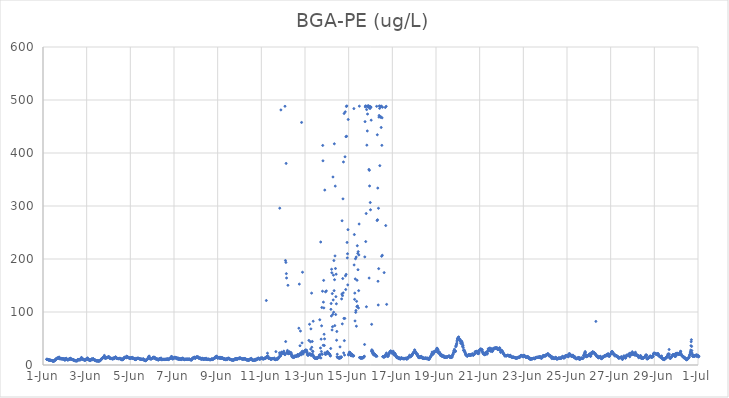
| Category | BGA-PE (ug/L) |
|---|---|
| 45078.166666666664 | 10.81 |
| 45078.177083333336 | 10.77 |
| 45078.1875 | 10.35 |
| 45078.197916666664 | 10.37 |
| 45078.208333333336 | 10.63 |
| 45078.21875 | 10.63 |
| 45078.229166666664 | 10.26 |
| 45078.239583333336 | 9.7 |
| 45078.25 | 9.62 |
| 45078.260416666664 | 9.4 |
| 45078.270833333336 | 9.34 |
| 45078.28125 | 9.77 |
| 45078.291666666664 | 9.37 |
| 45078.302083333336 | 9.26 |
| 45078.3125 | 9.15 |
| 45078.322916666664 | 9.18 |
| 45078.333333333336 | 8.92 |
| 45078.34375 | 8.85 |
| 45078.354166666664 | 8.88 |
| 45078.364583333336 | 8.66 |
| 45078.375 | 8.31 |
| 45078.385416666664 | 8.56 |
| 45078.395833333336 | 8.57 |
| 45078.40625 | 8.27 |
| 45078.416666666664 | 8.14 |
| 45078.427083333336 | 7.9 |
| 45078.4375 | 7.72 |
| 45078.447916666664 | 7.33 |
| 45078.458333333336 | 7.39 |
| 45078.46875 | 7.33 |
| 45078.479166666664 | 7.15 |
| 45078.489583333336 | 7.4 |
| 45078.5 | 7 |
| 45078.510416666664 | 7.7 |
| 45078.520833333336 | 8.78 |
| 45078.53125 | 8.8 |
| 45078.541666666664 | 8.57 |
| 45078.552083333336 | 9.94 |
| 45078.5625 | 9.75 |
| 45078.572916666664 | 9.3 |
| 45078.583333333336 | 10.43 |
| 45078.59375 | 11.25 |
| 45078.604166666664 | 10.8 |
| 45078.614583333336 | 12.3 |
| 45078.625 | 12.34 |
| 45078.635416666664 | 12.37 |
| 45078.645833333336 | 12.98 |
| 45078.65625 | 12.93 |
| 45078.666666666664 | 13.21 |
| 45078.677083333336 | 12.7 |
| 45078.6875 | 13.01 |
| 45078.697916666664 | 13.29 |
| 45078.708333333336 | 12.99 |
| 45078.71875 | 12.64 |
| 45078.729166666664 | 14.47 |
| 45078.739583333336 | 15.01 |
| 45078.75 | 13.16 |
| 45078.760416666664 | 12.14 |
| 45078.770833333336 | 11.75 |
| 45078.78125 | 11.6 |
| 45078.791666666664 | 11.71 |
| 45078.802083333336 | 12.4 |
| 45078.8125 | 12.02 |
| 45078.822916666664 | 12.32 |
| 45078.833333333336 | 12.54 |
| 45078.84375 | 11.91 |
| 45078.854166666664 | 11.48 |
| 45078.864583333336 | 11.45 |
| 45078.875 | 11.58 |
| 45078.885416666664 | 11.54 |
| 45078.895833333336 | 12.14 |
| 45078.90625 | 11.28 |
| 45078.916666666664 | 11.31 |
| 45078.927083333336 | 11.13 |
| 45078.9375 | 11.44 |
| 45078.947916666664 | 11.35 |
| 45078.958333333336 | 11.43 |
| 45078.96875 | 11.65 |
| 45078.979166666664 | 10.99 |
| 45078.989583333336 | 10.3 |
| 45079.0 | 9.05 |
| 45079.010416666664 | 9.32 |
| 45079.020833333336 | 11.8 |
| 45079.03125 | 11.96 |
| 45079.041666666664 | 11.67 |
| 45079.052083333336 | 11.95 |
| 45079.0625 | 12.75 |
| 45079.072916666664 | 11.94 |
| 45079.083333333336 | 11.46 |
| 45079.09375 | 10.55 |
| 45079.104166666664 | 10.71 |
| 45079.114583333336 | 10.12 |
| 45079.125 | 10.19 |
| 45079.135416666664 | 9.4 |
| 45079.145833333336 | 9.25 |
| 45079.15625 | 10.88 |
| 45079.166666666664 | 10.48 |
| 45079.177083333336 | 10.31 |
| 45079.1875 | 10.72 |
| 45079.197916666664 | 11.19 |
| 45079.208333333336 | 11.57 |
| 45079.21875 | 10.95 |
| 45079.229166666664 | 11.09 |
| 45079.239583333336 | 12.24 |
| 45079.25 | 12.82 |
| 45079.260416666664 | 11.53 |
| 45079.270833333336 | 10.8 |
| 45079.28125 | 11.95 |
| 45079.291666666664 | 10.8 |
| 45079.302083333336 | 10.86 |
| 45079.3125 | 10.47 |
| 45079.322916666664 | 10.61 |
| 45079.333333333336 | 10.8 |
| 45079.34375 | 10.16 |
| 45079.354166666664 | 10.04 |
| 45079.364583333336 | 10.22 |
| 45079.375 | 9.88 |
| 45079.385416666664 | 9.71 |
| 45079.395833333336 | 9.94 |
| 45079.40625 | 8.87 |
| 45079.416666666664 | 9.03 |
| 45079.427083333336 | 8.78 |
| 45079.4375 | 9.24 |
| 45079.447916666664 | 8.2 |
| 45079.458333333336 | 8.33 |
| 45079.46875 | 8.56 |
| 45079.479166666664 | 8.3 |
| 45079.489583333336 | 8.27 |
| 45079.5 | 7.51 |
| 45079.510416666664 | 8.25 |
| 45079.520833333336 | 8.45 |
| 45079.53125 | 8 |
| 45079.541666666664 | 7.95 |
| 45079.552083333336 | 7.73 |
| 45079.5625 | 7.63 |
| 45079.572916666664 | 8.63 |
| 45079.583333333336 | 9.19 |
| 45079.59375 | 10.37 |
| 45079.604166666664 | 9.85 |
| 45079.614583333336 | 9.75 |
| 45079.625 | 10.04 |
| 45079.635416666664 | 10 |
| 45079.645833333336 | 10.19 |
| 45079.65625 | 10.69 |
| 45079.666666666664 | 9.67 |
| 45079.677083333336 | 9.76 |
| 45079.6875 | 9.89 |
| 45079.697916666664 | 10.88 |
| 45079.708333333336 | 10.46 |
| 45079.71875 | 9.64 |
| 45079.729166666664 | 10.86 |
| 45079.739583333336 | 12.36 |
| 45079.75 | 12.41 |
| 45079.760416666664 | 14.23 |
| 45079.770833333336 | 13.57 |
| 45079.78125 | 11.77 |
| 45079.791666666664 | 11 |
| 45079.802083333336 | 11.28 |
| 45079.8125 | 11.03 |
| 45079.822916666664 | 10.96 |
| 45079.833333333336 | 11.15 |
| 45079.84375 | 10.66 |
| 45079.854166666664 | 10.65 |
| 45079.864583333336 | 10.25 |
| 45079.875 | 9.65 |
| 45079.885416666664 | 9.44 |
| 45079.895833333336 | 9.11 |
| 45079.90625 | 9.39 |
| 45079.916666666664 | 9.28 |
| 45079.927083333336 | 8.91 |
| 45079.9375 | 9.39 |
| 45079.947916666664 | 9.58 |
| 45079.958333333336 | 10.76 |
| 45079.96875 | 10.35 |
| 45079.979166666664 | 10.95 |
| 45079.989583333336 | 11.76 |
| 45080.0 | 11.17 |
| 45080.010416666664 | 11.07 |
| 45080.020833333336 | 11.18 |
| 45080.03125 | 12.58 |
| 45080.041666666664 | 13.38 |
| 45080.052083333336 | 11.37 |
| 45080.0625 | 11.43 |
| 45080.072916666664 | 9.9 |
| 45080.083333333336 | 9.93 |
| 45080.09375 | 9.94 |
| 45080.104166666664 | 10.17 |
| 45080.114583333336 | 10.21 |
| 45080.125 | 10.12 |
| 45080.135416666664 | 9.01 |
| 45080.145833333336 | 8.44 |
| 45080.15625 | 8.1 |
| 45080.166666666664 | 9.45 |
| 45080.177083333336 | 9.64 |
| 45080.1875 | 8.89 |
| 45080.197916666664 | 9.47 |
| 45080.208333333336 | 10.56 |
| 45080.21875 | 10.87 |
| 45080.229166666664 | 11.27 |
| 45080.239583333336 | 11.2 |
| 45080.25 | 10.38 |
| 45080.260416666664 | 10.29 |
| 45080.270833333336 | 10.09 |
| 45080.28125 | 10.67 |
| 45080.291666666664 | 12.09 |
| 45080.302083333336 | 11.79 |
| 45080.3125 | 10.56 |
| 45080.322916666664 | 10.71 |
| 45080.333333333336 | 10.58 |
| 45080.34375 | 9.72 |
| 45080.354166666664 | 9.1 |
| 45080.364583333336 | 8.88 |
| 45080.375 | 9.7 |
| 45080.385416666664 | 9.38 |
| 45080.395833333336 | 8.87 |
| 45080.40625 | 8.84 |
| 45080.416666666664 | 8.16 |
| 45080.427083333336 | 7.86 |
| 45080.4375 | 7.9 |
| 45080.447916666664 | 7.79 |
| 45080.458333333336 | 8.06 |
| 45080.46875 | 7.65 |
| 45080.479166666664 | 7.91 |
| 45080.489583333336 | 7.88 |
| 45080.5 | 7.65 |
| 45080.510416666664 | 7.66 |
| 45080.520833333336 | 7.95 |
| 45080.53125 | 7.54 |
| 45080.541666666664 | 7.15 |
| 45080.552083333336 | 7.63 |
| 45080.5625 | 7.9 |
| 45080.572916666664 | 7.79 |
| 45080.583333333336 | 7.64 |
| 45080.59375 | 7.97 |
| 45080.604166666664 | 8.16 |
| 45080.614583333336 | 7.93 |
| 45080.625 | 8.56 |
| 45080.635416666664 | 8.84 |
| 45080.645833333336 | 9.86 |
| 45080.65625 | 10.56 |
| 45080.666666666664 | 11.32 |
| 45080.677083333336 | 11.18 |
| 45080.6875 | 11.37 |
| 45080.697916666664 | 12.11 |
| 45080.708333333336 | 11.75 |
| 45080.71875 | 12.79 |
| 45080.729166666664 | 13.21 |
| 45080.739583333336 | 13.88 |
| 45080.75 | 14.28 |
| 45080.760416666664 | 14.29 |
| 45080.770833333336 | 14.77 |
| 45080.78125 | 15.59 |
| 45080.791666666664 | 14.17 |
| 45080.802083333336 | 16.22 |
| 45080.8125 | 18.12 |
| 45080.822916666664 | 14.23 |
| 45080.833333333336 | 12.89 |
| 45080.84375 | 13.37 |
| 45080.854166666664 | 13.21 |
| 45080.864583333336 | 12.62 |
| 45080.875 | 12.79 |
| 45080.885416666664 | 13.35 |
| 45080.895833333336 | 13.41 |
| 45080.90625 | 13.89 |
| 45080.916666666664 | 14.18 |
| 45080.927083333336 | 14.44 |
| 45080.9375 | 14.64 |
| 45080.947916666664 | 14.06 |
| 45080.958333333336 | 13.97 |
| 45080.96875 | 14.42 |
| 45080.979166666664 | 15.06 |
| 45080.989583333336 | 15.35 |
| 45081.0 | 14.92 |
| 45081.010416666664 | 15.9 |
| 45081.020833333336 | 15.15 |
| 45081.03125 | 14.37 |
| 45081.041666666664 | 14.33 |
| 45081.052083333336 | 12.56 |
| 45081.0625 | 13.2 |
| 45081.072916666664 | 12.9 |
| 45081.083333333336 | 12.86 |
| 45081.09375 | 12.15 |
| 45081.104166666664 | 12.17 |
| 45081.114583333336 | 12.42 |
| 45081.125 | 12.36 |
| 45081.135416666664 | 12.4 |
| 45081.145833333336 | 12.08 |
| 45081.15625 | 12.14 |
| 45081.166666666664 | 11.63 |
| 45081.177083333336 | 11.65 |
| 45081.1875 | 11.36 |
| 45081.197916666664 | 12.67 |
| 45081.208333333336 | 12.86 |
| 45081.21875 | 13.11 |
| 45081.229166666664 | 12.36 |
| 45081.239583333336 | 11.59 |
| 45081.25 | 13.48 |
| 45081.260416666664 | 12.46 |
| 45081.270833333336 | 12.23 |
| 45081.28125 | 12.64 |
| 45081.291666666664 | 14.08 |
| 45081.302083333336 | 14.53 |
| 45081.3125 | 14.69 |
| 45081.322916666664 | 15.16 |
| 45081.333333333336 | 14.82 |
| 45081.34375 | 13.65 |
| 45081.354166666664 | 14.23 |
| 45081.364583333336 | 13.51 |
| 45081.375 | 12.37 |
| 45081.385416666664 | 12.41 |
| 45081.395833333336 | 12.38 |
| 45081.40625 | 12.33 |
| 45081.416666666664 | 12.19 |
| 45081.427083333336 | 12.08 |
| 45081.4375 | 12.07 |
| 45081.447916666664 | 11.8 |
| 45081.458333333336 | 12.04 |
| 45081.46875 | 12.13 |
| 45081.479166666664 | 12.33 |
| 45081.489583333336 | 12.72 |
| 45081.5 | 12.39 |
| 45081.510416666664 | 12.05 |
| 45081.520833333336 | 11.77 |
| 45081.53125 | 12.26 |
| 45081.541666666664 | 12.22 |
| 45081.552083333336 | 12.44 |
| 45081.5625 | 11.04 |
| 45081.572916666664 | 11.05 |
| 45081.583333333336 | 10.63 |
| 45081.59375 | 11.15 |
| 45081.604166666664 | 10.63 |
| 45081.614583333336 | 9.63 |
| 45081.625 | 9.76 |
| 45081.635416666664 | 10.76 |
| 45081.645833333336 | 11.49 |
| 45081.65625 | 10.46 |
| 45081.666666666664 | 10.8 |
| 45081.677083333336 | 10.54 |
| 45081.6875 | 11.74 |
| 45081.697916666664 | 12.8 |
| 45081.708333333336 | 13.13 |
| 45081.71875 | 14.09 |
| 45081.729166666664 | 12.76 |
| 45081.739583333336 | 14.19 |
| 45081.75 | 14.89 |
| 45081.760416666664 | 14.52 |
| 45081.770833333336 | 14.28 |
| 45081.78125 | 14.32 |
| 45081.791666666664 | 14.15 |
| 45081.802083333336 | 14.88 |
| 45081.8125 | 13.56 |
| 45081.822916666664 | 15.25 |
| 45081.833333333336 | 16.64 |
| 45081.84375 | 14.86 |
| 45081.854166666664 | 15.2 |
| 45081.864583333336 | 15.71 |
| 45081.875 | 15.3 |
| 45081.885416666664 | 14.55 |
| 45081.895833333336 | 14.26 |
| 45081.90625 | 13.72 |
| 45081.916666666664 | 14.38 |
| 45081.927083333336 | 13.92 |
| 45081.9375 | 13.82 |
| 45081.947916666664 | 13.23 |
| 45081.958333333336 | 12.48 |
| 45081.96875 | 12.66 |
| 45081.979166666664 | 12.41 |
| 45081.989583333336 | 12.55 |
| 45082.0 | 12.36 |
| 45082.010416666664 | 13.15 |
| 45082.020833333336 | 13.23 |
| 45082.03125 | 13.63 |
| 45082.041666666664 | 13.71 |
| 45082.052083333336 | 13.28 |
| 45082.0625 | 13.35 |
| 45082.072916666664 | 13.57 |
| 45082.083333333336 | 13.24 |
| 45082.09375 | 13.04 |
| 45082.104166666664 | 14.34 |
| 45082.114583333336 | 12.39 |
| 45082.125 | 12.1 |
| 45082.135416666664 | 12 |
| 45082.145833333336 | 12.43 |
| 45082.15625 | 12.42 |
| 45082.166666666664 | 12.14 |
| 45082.177083333336 | 12.24 |
| 45082.1875 | 11.4 |
| 45082.197916666664 | 11.14 |
| 45082.208333333336 | 10.89 |
| 45082.21875 | 10.52 |
| 45082.229166666664 | 10.44 |
| 45082.239583333336 | 10.19 |
| 45082.25 | 11.1 |
| 45082.260416666664 | 12.88 |
| 45082.270833333336 | 10.94 |
| 45082.28125 | 11.42 |
| 45082.291666666664 | 11.5 |
| 45082.302083333336 | 12.37 |
| 45082.3125 | 12.75 |
| 45082.322916666664 | 12.31 |
| 45082.333333333336 | 12.86 |
| 45082.34375 | 12.5 |
| 45082.354166666664 | 12.43 |
| 45082.364583333336 | 12.52 |
| 45082.375 | 12.83 |
| 45082.385416666664 | 12.1 |
| 45082.395833333336 | 12.62 |
| 45082.40625 | 11.87 |
| 45082.416666666664 | 11.96 |
| 45082.427083333336 | 11.47 |
| 45082.4375 | 11.29 |
| 45082.447916666664 | 11 |
| 45082.458333333336 | 10.97 |
| 45082.46875 | 11.32 |
| 45082.479166666664 | 10.86 |
| 45082.489583333336 | 11.31 |
| 45082.5 | 10.76 |
| 45082.510416666664 | 10.63 |
| 45082.520833333336 | 10.81 |
| 45082.53125 | 10.86 |
| 45082.541666666664 | 10.58 |
| 45082.552083333336 | 10.44 |
| 45082.5625 | 10.54 |
| 45082.572916666664 | 11.25 |
| 45082.583333333336 | 9.88 |
| 45082.59375 | 11.49 |
| 45082.604166666664 | 11.42 |
| 45082.614583333336 | 9.75 |
| 45082.625 | 9.96 |
| 45082.635416666664 | 9.34 |
| 45082.645833333336 | 8.64 |
| 45082.65625 | 9.08 |
| 45082.666666666664 | 8.72 |
| 45082.677083333336 | 8.77 |
| 45082.6875 | 8.07 |
| 45082.697916666664 | 9.36 |
| 45082.708333333336 | 8.1 |
| 45082.71875 | 9.25 |
| 45082.729166666664 | 9.19 |
| 45082.739583333336 | 9.85 |
| 45082.75 | 9.89 |
| 45082.760416666664 | 10.4 |
| 45082.770833333336 | 10.77 |
| 45082.78125 | 11.46 |
| 45082.791666666664 | 12.11 |
| 45082.802083333336 | 12.11 |
| 45082.8125 | 11.87 |
| 45082.822916666664 | 13.4 |
| 45082.833333333336 | 14.23 |
| 45082.84375 | 15.83 |
| 45082.854166666664 | 16.6 |
| 45082.864583333336 | 16.65 |
| 45082.875 | 13.11 |
| 45082.885416666664 | 12.4 |
| 45082.895833333336 | 12.02 |
| 45082.90625 | 11.34 |
| 45082.916666666664 | 12 |
| 45082.927083333336 | 11.62 |
| 45082.9375 | 11.5 |
| 45082.947916666664 | 11.81 |
| 45082.958333333336 | 11.6 |
| 45082.96875 | 11.84 |
| 45082.979166666664 | 11.72 |
| 45082.989583333336 | 11.88 |
| 45083.0 | 12.6 |
| 45083.010416666664 | 12.93 |
| 45083.020833333336 | 13.6 |
| 45083.03125 | 13.74 |
| 45083.041666666664 | 14.47 |
| 45083.052083333336 | 14.87 |
| 45083.0625 | 13.29 |
| 45083.072916666664 | 13.13 |
| 45083.083333333336 | 13.65 |
| 45083.09375 | 14.74 |
| 45083.104166666664 | 14.01 |
| 45083.114583333336 | 13.83 |
| 45083.125 | 12.19 |
| 45083.135416666664 | 12.93 |
| 45083.145833333336 | 13.29 |
| 45083.15625 | 11.9 |
| 45083.166666666664 | 11.34 |
| 45083.177083333336 | 11.46 |
| 45083.1875 | 11.17 |
| 45083.197916666664 | 11.47 |
| 45083.208333333336 | 11.32 |
| 45083.21875 | 10.82 |
| 45083.229166666664 | 10.88 |
| 45083.239583333336 | 11 |
| 45083.25 | 11.08 |
| 45083.260416666664 | 10.21 |
| 45083.270833333336 | 9.24 |
| 45083.28125 | 9.98 |
| 45083.291666666664 | 9.78 |
| 45083.302083333336 | 10.09 |
| 45083.3125 | 11.26 |
| 45083.322916666664 | 11.31 |
| 45083.333333333336 | 12.08 |
| 45083.34375 | 11.67 |
| 45083.354166666664 | 11.76 |
| 45083.364583333336 | 11.74 |
| 45083.375 | 11.64 |
| 45083.385416666664 | 11.3 |
| 45083.395833333336 | 12.14 |
| 45083.40625 | 13.31 |
| 45083.416666666664 | 10.35 |
| 45083.427083333336 | 10.06 |
| 45083.4375 | 10.43 |
| 45083.447916666664 | 10.16 |
| 45083.458333333336 | 10.3 |
| 45083.46875 | 10.47 |
| 45083.479166666664 | 10.24 |
| 45083.489583333336 | 10.42 |
| 45083.5 | 10.38 |
| 45083.510416666664 | 10.59 |
| 45083.520833333336 | 10.49 |
| 45083.53125 | 10.78 |
| 45083.541666666664 | 10.31 |
| 45083.552083333336 | 10.27 |
| 45083.5625 | 10.53 |
| 45083.572916666664 | 10.8 |
| 45083.583333333336 | 10.42 |
| 45083.59375 | 10.79 |
| 45083.604166666664 | 10.8 |
| 45083.614583333336 | 10.44 |
| 45083.625 | 10.38 |
| 45083.635416666664 | 11.05 |
| 45083.645833333336 | 11.05 |
| 45083.65625 | 10.66 |
| 45083.666666666664 | 10.62 |
| 45083.677083333336 | 11.04 |
| 45083.6875 | 10.61 |
| 45083.697916666664 | 11.67 |
| 45083.708333333336 | 11.05 |
| 45083.71875 | 11.1 |
| 45083.729166666664 | 10.38 |
| 45083.739583333336 | 10.14 |
| 45083.75 | 10.88 |
| 45083.760416666664 | 11.4 |
| 45083.770833333336 | 11.34 |
| 45083.78125 | 11.31 |
| 45083.791666666664 | 11.4 |
| 45083.802083333336 | 12.03 |
| 45083.8125 | 12.28 |
| 45083.822916666664 | 12.74 |
| 45083.833333333336 | 12.89 |
| 45083.84375 | 13 |
| 45083.854166666664 | 14.28 |
| 45083.864583333336 | 14.51 |
| 45083.875 | 15.62 |
| 45083.885416666664 | 16.13 |
| 45083.895833333336 | 15.84 |
| 45083.90625 | 13.8 |
| 45083.916666666664 | 12.18 |
| 45083.927083333336 | 11.42 |
| 45083.9375 | 11.78 |
| 45083.947916666664 | 12.33 |
| 45083.958333333336 | 11.87 |
| 45083.96875 | 11.91 |
| 45083.979166666664 | 12.27 |
| 45083.989583333336 | 12.97 |
| 45084.0 | 13.27 |
| 45084.010416666664 | 13.87 |
| 45084.020833333336 | 13.96 |
| 45084.03125 | 14.35 |
| 45084.041666666664 | 14.72 |
| 45084.052083333336 | 14.57 |
| 45084.0625 | 13.54 |
| 45084.072916666664 | 13.35 |
| 45084.083333333336 | 13.68 |
| 45084.09375 | 13.22 |
| 45084.104166666664 | 13.72 |
| 45084.114583333336 | 13.42 |
| 45084.125 | 12.01 |
| 45084.135416666664 | 11.66 |
| 45084.145833333336 | 12.55 |
| 45084.15625 | 11.78 |
| 45084.166666666664 | 11.46 |
| 45084.177083333336 | 13.62 |
| 45084.1875 | 12.65 |
| 45084.197916666664 | 11.13 |
| 45084.208333333336 | 10.9 |
| 45084.21875 | 11.21 |
| 45084.229166666664 | 10.95 |
| 45084.239583333336 | 11.53 |
| 45084.25 | 10.71 |
| 45084.260416666664 | 11.45 |
| 45084.270833333336 | 12.27 |
| 45084.28125 | 11.53 |
| 45084.291666666664 | 10.48 |
| 45084.302083333336 | 10.54 |
| 45084.3125 | 11.55 |
| 45084.322916666664 | 10.05 |
| 45084.333333333336 | 10.2 |
| 45084.34375 | 10.87 |
| 45084.354166666664 | 11.87 |
| 45084.364583333336 | 12.48 |
| 45084.375 | 12.04 |
| 45084.385416666664 | 13.12 |
| 45084.395833333336 | 12.15 |
| 45084.40625 | 11.16 |
| 45084.416666666664 | 11.12 |
| 45084.427083333336 | 10.56 |
| 45084.4375 | 12.43 |
| 45084.447916666664 | 10.64 |
| 45084.458333333336 | 10.21 |
| 45084.46875 | 10.27 |
| 45084.479166666664 | 10.41 |
| 45084.489583333336 | 9.99 |
| 45084.5 | 10.34 |
| 45084.510416666664 | 10.73 |
| 45084.520833333336 | 10.59 |
| 45084.53125 | 10.8 |
| 45084.541666666664 | 10.92 |
| 45084.552083333336 | 11.04 |
| 45084.5625 | 10.86 |
| 45084.572916666664 | 10.66 |
| 45084.583333333336 | 10.93 |
| 45084.59375 | 10.92 |
| 45084.604166666664 | 10.42 |
| 45084.614583333336 | 10.77 |
| 45084.625 | 11.06 |
| 45084.635416666664 | 11.17 |
| 45084.645833333336 | 10.8 |
| 45084.65625 | 10.55 |
| 45084.666666666664 | 10.59 |
| 45084.677083333336 | 10.88 |
| 45084.6875 | 10.42 |
| 45084.697916666664 | 11.72 |
| 45084.708333333336 | 10.45 |
| 45084.71875 | 10.22 |
| 45084.729166666664 | 10.61 |
| 45084.739583333336 | 10.18 |
| 45084.75 | 9.96 |
| 45084.760416666664 | 9.59 |
| 45084.770833333336 | 10.52 |
| 45084.78125 | 10.44 |
| 45084.791666666664 | 9.65 |
| 45084.802083333336 | 9.7 |
| 45084.8125 | 9.44 |
| 45084.822916666664 | 11.43 |
| 45084.833333333336 | 11.8 |
| 45084.84375 | 12.12 |
| 45084.854166666664 | 12.91 |
| 45084.864583333336 | 12.77 |
| 45084.875 | 13.07 |
| 45084.885416666664 | 12.98 |
| 45084.895833333336 | 13.94 |
| 45084.90625 | 14.28 |
| 45084.916666666664 | 14.04 |
| 45084.927083333336 | 14.71 |
| 45084.9375 | 14.52 |
| 45084.947916666664 | 13.75 |
| 45084.958333333336 | 12.95 |
| 45084.96875 | 12.7 |
| 45084.979166666664 | 12.69 |
| 45084.989583333336 | 13.28 |
| 45085.0 | 13.5 |
| 45085.010416666664 | 14.41 |
| 45085.020833333336 | 15.18 |
| 45085.03125 | 15.27 |
| 45085.041666666664 | 15.07 |
| 45085.052083333336 | 14.85 |
| 45085.0625 | 14.22 |
| 45085.072916666664 | 15.32 |
| 45085.083333333336 | 14.97 |
| 45085.09375 | 15.02 |
| 45085.104166666664 | 15.36 |
| 45085.114583333336 | 13.45 |
| 45085.125 | 13.18 |
| 45085.135416666664 | 13.72 |
| 45085.145833333336 | 13.36 |
| 45085.15625 | 12.75 |
| 45085.166666666664 | 12.63 |
| 45085.177083333336 | 12.23 |
| 45085.1875 | 12.48 |
| 45085.197916666664 | 12.96 |
| 45085.208333333336 | 13.24 |
| 45085.21875 | 11.89 |
| 45085.229166666664 | 11.79 |
| 45085.239583333336 | 11.47 |
| 45085.25 | 10.83 |
| 45085.260416666664 | 11.12 |
| 45085.270833333336 | 11.67 |
| 45085.28125 | 12.78 |
| 45085.291666666664 | 12.34 |
| 45085.302083333336 | 12.29 |
| 45085.3125 | 12.56 |
| 45085.322916666664 | 11.5 |
| 45085.333333333336 | 10.46 |
| 45085.34375 | 10.9 |
| 45085.354166666664 | 10.74 |
| 45085.364583333336 | 11 |
| 45085.375 | 11.06 |
| 45085.385416666664 | 11.57 |
| 45085.395833333336 | 10.9 |
| 45085.40625 | 11.82 |
| 45085.416666666664 | 12.01 |
| 45085.427083333336 | 11.3 |
| 45085.4375 | 11.31 |
| 45085.447916666664 | 11.04 |
| 45085.458333333336 | 11.67 |
| 45085.46875 | 12.88 |
| 45085.479166666664 | 11.47 |
| 45085.489583333336 | 10.45 |
| 45085.5 | 11.14 |
| 45085.510416666664 | 10.57 |
| 45085.520833333336 | 10.5 |
| 45085.53125 | 10.64 |
| 45085.541666666664 | 10.85 |
| 45085.552083333336 | 10.28 |
| 45085.5625 | 11.02 |
| 45085.572916666664 | 10.57 |
| 45085.583333333336 | 10.64 |
| 45085.59375 | 11.23 |
| 45085.604166666664 | 10.58 |
| 45085.614583333336 | 10.39 |
| 45085.625 | 10.48 |
| 45085.635416666664 | 10 |
| 45085.645833333336 | 9.83 |
| 45085.65625 | 10.6 |
| 45085.666666666664 | 9.8 |
| 45085.677083333336 | 10.21 |
| 45085.6875 | 10.27 |
| 45085.697916666664 | 9.96 |
| 45085.708333333336 | 10.58 |
| 45085.71875 | 11.28 |
| 45085.729166666664 | 11.09 |
| 45085.739583333336 | 11.68 |
| 45085.75 | 10.91 |
| 45085.760416666664 | 10.24 |
| 45085.770833333336 | 10.83 |
| 45085.78125 | 11.09 |
| 45085.791666666664 | 10.84 |
| 45085.802083333336 | 11.49 |
| 45085.8125 | 12.27 |
| 45085.822916666664 | 12.15 |
| 45085.833333333336 | 12.26 |
| 45085.84375 | 12.64 |
| 45085.854166666664 | 12.21 |
| 45085.864583333336 | 12.92 |
| 45085.875 | 13.22 |
| 45085.885416666664 | 14.62 |
| 45085.895833333336 | 15.58 |
| 45085.90625 | 14.58 |
| 45085.916666666664 | 15.09 |
| 45085.927083333336 | 14.7 |
| 45085.9375 | 15.04 |
| 45085.947916666664 | 15.02 |
| 45085.958333333336 | 16.83 |
| 45085.96875 | 14.22 |
| 45085.979166666664 | 13.59 |
| 45085.989583333336 | 13.43 |
| 45086.0 | 13.12 |
| 45086.010416666664 | 13.26 |
| 45086.020833333336 | 13.66 |
| 45086.03125 | 14.17 |
| 45086.041666666664 | 13.49 |
| 45086.052083333336 | 13.87 |
| 45086.0625 | 13.59 |
| 45086.072916666664 | 13.68 |
| 45086.083333333336 | 13.09 |
| 45086.09375 | 14.43 |
| 45086.104166666664 | 12.52 |
| 45086.114583333336 | 12.96 |
| 45086.125 | 12.72 |
| 45086.135416666664 | 12.73 |
| 45086.145833333336 | 14.51 |
| 45086.15625 | 12.91 |
| 45086.166666666664 | 12.72 |
| 45086.177083333336 | 12.69 |
| 45086.1875 | 12.62 |
| 45086.197916666664 | 13.93 |
| 45086.208333333336 | 12.99 |
| 45086.21875 | 13.18 |
| 45086.229166666664 | 12.36 |
| 45086.239583333336 | 13.28 |
| 45086.25 | 11.77 |
| 45086.260416666664 | 11.34 |
| 45086.270833333336 | 11.36 |
| 45086.28125 | 11.54 |
| 45086.291666666664 | 11.34 |
| 45086.302083333336 | 11.76 |
| 45086.3125 | 10.59 |
| 45086.322916666664 | 11.5 |
| 45086.333333333336 | 11.9 |
| 45086.34375 | 10.26 |
| 45086.354166666664 | 10.57 |
| 45086.364583333336 | 10.04 |
| 45086.375 | 10.56 |
| 45086.385416666664 | 11.51 |
| 45086.395833333336 | 10.72 |
| 45086.40625 | 11.06 |
| 45086.416666666664 | 10.46 |
| 45086.427083333336 | 9.82 |
| 45086.4375 | 12.42 |
| 45086.447916666664 | 11.08 |
| 45086.458333333336 | 12.43 |
| 45086.46875 | 12.18 |
| 45086.479166666664 | 12.07 |
| 45086.489583333336 | 11.81 |
| 45086.5 | 12.73 |
| 45086.510416666664 | 13.07 |
| 45086.520833333336 | 12.26 |
| 45086.53125 | 12.06 |
| 45086.541666666664 | 11.13 |
| 45086.552083333336 | 10.83 |
| 45086.5625 | 10.59 |
| 45086.572916666664 | 11 |
| 45086.583333333336 | 10.35 |
| 45086.59375 | 10.41 |
| 45086.604166666664 | 9.91 |
| 45086.614583333336 | 9.91 |
| 45086.625 | 9.82 |
| 45086.635416666664 | 9.75 |
| 45086.645833333336 | 9.54 |
| 45086.65625 | 9.68 |
| 45086.666666666664 | 9.29 |
| 45086.677083333336 | 9.47 |
| 45086.6875 | 9.13 |
| 45086.697916666664 | 9.54 |
| 45086.708333333336 | 9.39 |
| 45086.71875 | 9.16 |
| 45086.729166666664 | 9.33 |
| 45086.739583333336 | 9.15 |
| 45086.75 | 9.6 |
| 45086.760416666664 | 10.65 |
| 45086.770833333336 | 10.83 |
| 45086.78125 | 11.41 |
| 45086.791666666664 | 10.66 |
| 45086.802083333336 | 10.26 |
| 45086.8125 | 11.19 |
| 45086.822916666664 | 11.97 |
| 45086.833333333336 | 11.87 |
| 45086.84375 | 12.37 |
| 45086.854166666664 | 11.78 |
| 45086.864583333336 | 11.74 |
| 45086.875 | 10.73 |
| 45086.885416666664 | 10.63 |
| 45086.895833333336 | 11 |
| 45086.90625 | 12.2 |
| 45086.916666666664 | 11.61 |
| 45086.927083333336 | 11.83 |
| 45086.9375 | 12.15 |
| 45086.947916666664 | 12.02 |
| 45086.958333333336 | 12.58 |
| 45086.96875 | 12.34 |
| 45086.979166666664 | 11.76 |
| 45086.989583333336 | 11.88 |
| 45087.0 | 13.76 |
| 45087.010416666664 | 12.42 |
| 45087.020833333336 | 12.38 |
| 45087.03125 | 13.37 |
| 45087.041666666664 | 12.33 |
| 45087.052083333336 | 13.27 |
| 45087.0625 | 12.04 |
| 45087.072916666664 | 11.96 |
| 45087.083333333336 | 11.94 |
| 45087.09375 | 11.75 |
| 45087.104166666664 | 11.49 |
| 45087.114583333336 | 11.71 |
| 45087.125 | 11.53 |
| 45087.135416666664 | 11.4 |
| 45087.145833333336 | 11.04 |
| 45087.15625 | 10.81 |
| 45087.166666666664 | 11.04 |
| 45087.177083333336 | 11.43 |
| 45087.1875 | 11.61 |
| 45087.197916666664 | 11.76 |
| 45087.208333333336 | 11.55 |
| 45087.21875 | 12.15 |
| 45087.229166666664 | 11.4 |
| 45087.239583333336 | 11.82 |
| 45087.25 | 11.02 |
| 45087.260416666664 | 11.67 |
| 45087.270833333336 | 10.43 |
| 45087.28125 | 11.79 |
| 45087.291666666664 | 10.64 |
| 45087.302083333336 | 10.33 |
| 45087.3125 | 10.22 |
| 45087.322916666664 | 9.28 |
| 45087.333333333336 | 9.83 |
| 45087.34375 | 10.16 |
| 45087.354166666664 | 9.4 |
| 45087.364583333336 | 10.15 |
| 45087.375 | 9 |
| 45087.385416666664 | 9.82 |
| 45087.395833333336 | 10 |
| 45087.40625 | 8.78 |
| 45087.416666666664 | 8.64 |
| 45087.427083333336 | 9.25 |
| 45087.4375 | 9.7 |
| 45087.447916666664 | 9.61 |
| 45087.458333333336 | 10.09 |
| 45087.46875 | 10.81 |
| 45087.479166666664 | 11.25 |
| 45087.489583333336 | 10.73 |
| 45087.5 | 10.66 |
| 45087.510416666664 | 11.01 |
| 45087.520833333336 | 11.1 |
| 45087.53125 | 11.83 |
| 45087.541666666664 | 12.49 |
| 45087.552083333336 | 10.86 |
| 45087.5625 | 10.09 |
| 45087.572916666664 | 10.07 |
| 45087.583333333336 | 9.19 |
| 45087.59375 | 9 |
| 45087.604166666664 | 9.12 |
| 45087.614583333336 | 9.57 |
| 45087.625 | 9.46 |
| 45087.635416666664 | 8.91 |
| 45087.645833333336 | 8.6 |
| 45087.65625 | 9.18 |
| 45087.666666666664 | 8.63 |
| 45087.677083333336 | 8.72 |
| 45087.6875 | 8.92 |
| 45087.697916666664 | 8.95 |
| 45087.708333333336 | 8.79 |
| 45087.71875 | 10.99 |
| 45087.729166666664 | 9.73 |
| 45087.739583333336 | 9.94 |
| 45087.75 | 9.41 |
| 45087.760416666664 | 10.58 |
| 45087.770833333336 | 9.78 |
| 45087.78125 | 10.52 |
| 45087.791666666664 | 11.11 |
| 45087.802083333336 | 10.66 |
| 45087.8125 | 11.77 |
| 45087.822916666664 | 11.16 |
| 45087.833333333336 | 12.51 |
| 45087.84375 | 11.24 |
| 45087.854166666664 | 11.78 |
| 45087.864583333336 | 13.09 |
| 45087.875 | 12.2 |
| 45087.885416666664 | 12.84 |
| 45087.895833333336 | 12.61 |
| 45087.90625 | 11.67 |
| 45087.916666666664 | 11.11 |
| 45087.927083333336 | 11.03 |
| 45087.9375 | 10.74 |
| 45087.947916666664 | 11.85 |
| 45087.958333333336 | 12.58 |
| 45087.96875 | 13 |
| 45087.979166666664 | 12.77 |
| 45087.989583333336 | 13.05 |
| 45088.0 | 12.76 |
| 45088.010416666664 | 12.89 |
| 45088.020833333336 | 12.58 |
| 45088.03125 | 13.09 |
| 45088.041666666664 | 13.1 |
| 45088.052083333336 | 13.27 |
| 45088.0625 | 11.42 |
| 45088.072916666664 | 11.55 |
| 45088.083333333336 | 11.93 |
| 45088.09375 | 11.8 |
| 45088.104166666664 | 11.5 |
| 45088.114583333336 | 11.41 |
| 45088.125 | 11.89 |
| 45088.135416666664 | 12.13 |
| 45088.145833333336 | 12.56 |
| 45088.15625 | 12.67 |
| 45088.166666666664 | 13.41 |
| 45088.177083333336 | 12.82 |
| 45088.1875 | 13.06 |
| 45088.197916666664 | 12.84 |
| 45088.208333333336 | 13.18 |
| 45088.21875 | 13.74 |
| 45088.229166666664 | 121.68 |
| 45088.239583333336 | 15.17 |
| 45088.25 | 15.89 |
| 45088.260416666664 | 16.27 |
| 45088.270833333336 | 14.5 |
| 45088.28125 | 22.33 |
| 45088.291666666664 | 17.54 |
| 45088.302083333336 | 13.87 |
| 45088.3125 | 14.07 |
| 45088.322916666664 | 12.68 |
| 45088.333333333336 | 12.71 |
| 45088.34375 | 13.3 |
| 45088.354166666664 | 12.52 |
| 45088.364583333336 | 12.9 |
| 45088.375 | 12.39 |
| 45088.385416666664 | 13.1 |
| 45088.395833333336 | 12.8 |
| 45088.40625 | 11.58 |
| 45088.416666666664 | 11.8 |
| 45088.427083333336 | 10.67 |
| 45088.4375 | 10.94 |
| 45088.447916666664 | 11.56 |
| 45088.458333333336 | 10.96 |
| 45088.46875 | 11.31 |
| 45088.479166666664 | 11.74 |
| 45088.489583333336 | 11.93 |
| 45088.5 | 11.8 |
| 45088.510416666664 | 12.11 |
| 45088.520833333336 | 12.35 |
| 45088.53125 | 11.91 |
| 45088.541666666664 | 11.93 |
| 45088.552083333336 | 11.92 |
| 45088.5625 | 12.05 |
| 45088.572916666664 | 12 |
| 45088.583333333336 | 12.84 |
| 45088.59375 | 13.05 |
| 45088.604166666664 | 11.58 |
| 45088.614583333336 | 10.98 |
| 45088.625 | 10.53 |
| 45088.635416666664 | 10.41 |
| 45088.645833333336 | 10.02 |
| 45088.65625 | 10.78 |
| 45088.666666666664 | 25.26 |
| 45088.677083333336 | 10.93 |
| 45088.6875 | 11.37 |
| 45088.697916666664 | 11.17 |
| 45088.708333333336 | 11.42 |
| 45088.71875 | 11.5 |
| 45088.729166666664 | 11.34 |
| 45088.739583333336 | 11 |
| 45088.75 | 11.4 |
| 45088.760416666664 | 11.51 |
| 45088.770833333336 | 12.44 |
| 45088.78125 | 13.43 |
| 45088.791666666664 | 13.71 |
| 45088.802083333336 | 14.13 |
| 45088.8125 | 15.56 |
| 45088.822916666664 | 15.32 |
| 45088.833333333336 | 22.95 |
| 45088.84375 | 295.89 |
| 45088.854166666664 | 19.96 |
| 45088.864583333336 | 16.92 |
| 45088.875 | 17.75 |
| 45088.885416666664 | 17.4 |
| 45088.895833333336 | 481.27 |
| 45088.90625 | 21.25 |
| 45088.916666666664 | 23.29 |
| 45088.927083333336 | 23.9 |
| 45088.9375 | 24.15 |
| 45088.947916666664 | 22.85 |
| 45088.958333333336 | 22.83 |
| 45088.96875 | 23.01 |
| 45088.979166666664 | 21.51 |
| 45088.989583333336 | 22.55 |
| 45089.0 | 23.74 |
| 45089.010416666664 | 22.41 |
| 45089.020833333336 | 23.86 |
| 45089.03125 | 26.2 |
| 45089.041666666664 | 22.77 |
| 45089.052083333336 | 22.01 |
| 45089.0625 | 20.58 |
| 45089.072916666664 | 19.73 |
| 45089.083333333336 | 488.18 |
| 45089.09375 | 19.75 |
| 45089.104166666664 | 197.22 |
| 45089.114583333336 | 44.23 |
| 45089.125 | 193.53 |
| 45089.135416666664 | 380.33 |
| 45089.145833333336 | 172.36 |
| 45089.15625 | 164.16 |
| 45089.166666666664 | 22.95 |
| 45089.177083333336 | 23.4 |
| 45089.1875 | 24.9 |
| 45089.197916666664 | 27.52 |
| 45089.208333333336 | 23.06 |
| 45089.21875 | 150.4 |
| 45089.229166666664 | 21.42 |
| 45089.239583333336 | 21.73 |
| 45089.25 | 21.34 |
| 45089.260416666664 | 22.73 |
| 45089.270833333336 | 23.25 |
| 45089.28125 | 22.37 |
| 45089.291666666664 | 25.03 |
| 45089.302083333336 | 22.47 |
| 45089.3125 | 22.36 |
| 45089.322916666664 | 21.76 |
| 45089.333333333336 | 23.21 |
| 45089.34375 | 22.25 |
| 45089.354166666664 | 21.35 |
| 45089.364583333336 | 23.4 |
| 45089.375 | 19.46 |
| 45089.385416666664 | 17.06 |
| 45089.395833333336 | 19.7 |
| 45089.40625 | 16.89 |
| 45089.416666666664 | 14.95 |
| 45089.427083333336 | 15.06 |
| 45089.4375 | 15.72 |
| 45089.447916666664 | 15.45 |
| 45089.458333333336 | 15.46 |
| 45089.46875 | 14.51 |
| 45089.479166666664 | 14.08 |
| 45089.489583333336 | 15.41 |
| 45089.5 | 15.05 |
| 45089.510416666664 | 15.1 |
| 45089.520833333336 | 15.43 |
| 45089.53125 | 16.92 |
| 45089.541666666664 | 17.02 |
| 45089.552083333336 | 16.38 |
| 45089.5625 | 16.5 |
| 45089.572916666664 | 16.51 |
| 45089.583333333336 | 15.8 |
| 45089.59375 | 16.06 |
| 45089.604166666664 | 17.08 |
| 45089.614583333336 | 17.93 |
| 45089.625 | 16.38 |
| 45089.635416666664 | 17.63 |
| 45089.645833333336 | 16.71 |
| 45089.65625 | 19.32 |
| 45089.666666666664 | 19.68 |
| 45089.677083333336 | 19.69 |
| 45089.6875 | 18.24 |
| 45089.697916666664 | 17.01 |
| 45089.708333333336 | 17.18 |
| 45089.71875 | 69.4 |
| 45089.729166666664 | 18.12 |
| 45089.739583333336 | 152.62 |
| 45089.75 | 18.32 |
| 45089.760416666664 | 20.57 |
| 45089.770833333336 | 36.34 |
| 45089.78125 | 21.33 |
| 45089.791666666664 | 64.09 |
| 45089.802083333336 | 20.54 |
| 45089.8125 | 23.17 |
| 45089.822916666664 | 19.14 |
| 45089.833333333336 | 23.03 |
| 45089.84375 | 457.67 |
| 45089.854166666664 | 22.41 |
| 45089.864583333336 | 41.68 |
| 45089.875 | 26.07 |
| 45089.885416666664 | 175.04 |
| 45089.895833333336 | 22.18 |
| 45089.90625 | 20.57 |
| 45089.916666666664 | 23.01 |
| 45089.927083333336 | 23.17 |
| 45089.9375 | 24.73 |
| 45089.947916666664 | 24.74 |
| 45089.958333333336 | 25.59 |
| 45089.96875 | 25.28 |
| 45089.979166666664 | 26.2 |
| 45089.989583333336 | 26.46 |
| 45090.0 | 27.66 |
| 45090.010416666664 | 25.81 |
| 45090.020833333336 | 27.99 |
| 45090.03125 | 28.27 |
| 45090.041666666664 | 26.16 |
| 45090.052083333336 | 26.55 |
| 45090.0625 | 25.7 |
| 45090.072916666664 | 27.93 |
| 45090.083333333336 | 24.28 |
| 45090.09375 | 24.79 |
| 45090.104166666664 | 21.96 |
| 45090.114583333336 | 19.45 |
| 45090.125 | 19.36 |
| 45090.135416666664 | 18.13 |
| 45090.145833333336 | 19.02 |
| 45090.15625 | 20.78 |
| 45090.166666666664 | 19.13 |
| 45090.177083333336 | 46.37 |
| 45090.1875 | 19.52 |
| 45090.197916666664 | 19.77 |
| 45090.208333333336 | 76.83 |
| 45090.21875 | 21.23 |
| 45090.229166666664 | 21.17 |
| 45090.239583333336 | 19.43 |
| 45090.25 | 43.78 |
| 45090.260416666664 | 29.95 |
| 45090.270833333336 | 68.14 |
| 45090.28125 | 17.99 |
| 45090.291666666664 | 18.87 |
| 45090.302083333336 | 135.59 |
| 45090.3125 | 33.54 |
| 45090.322916666664 | 20.67 |
| 45090.333333333336 | 44.49 |
| 45090.34375 | 26.21 |
| 45090.354166666664 | 19.86 |
| 45090.364583333336 | 25.35 |
| 45090.375 | 82.59 |
| 45090.385416666664 | 17.64 |
| 45090.395833333336 | 16.06 |
| 45090.40625 | 14.91 |
| 45090.416666666664 | 14.36 |
| 45090.427083333336 | 13.47 |
| 45090.4375 | 13.59 |
| 45090.447916666664 | 13.25 |
| 45090.458333333336 | 12.82 |
| 45090.46875 | 12.74 |
| 45090.479166666664 | 12.65 |
| 45090.489583333336 | 12.43 |
| 45090.5 | 12.85 |
| 45090.510416666664 | 13.89 |
| 45090.520833333336 | 12.71 |
| 45090.53125 | 12.89 |
| 45090.541666666664 | 12.24 |
| 45090.552083333336 | 12.95 |
| 45090.5625 | 12.37 |
| 45090.572916666664 | 12.93 |
| 45090.583333333336 | 13.86 |
| 45090.59375 | 14.54 |
| 45090.604166666664 | 15.15 |
| 45090.614583333336 | 14.39 |
| 45090.625 | 14.76 |
| 45090.635416666664 | 14.11 |
| 45090.645833333336 | 15.07 |
| 45090.65625 | 18.81 |
| 45090.666666666664 | 16.46 |
| 45090.677083333336 | 85.34 |
| 45090.6875 | 19.09 |
| 45090.697916666664 | 19.48 |
| 45090.708333333336 | 32.1 |
| 45090.71875 | 232.05 |
| 45090.729166666664 | 13.2 |
| 45090.739583333336 | 48.75 |
| 45090.75 | 25.45 |
| 45090.760416666664 | 73.92 |
| 45090.770833333336 | 108.47 |
| 45090.78125 | 20.65 |
| 45090.791666666664 | 20.15 |
| 45090.802083333336 | 139.22 |
| 45090.8125 | 414.3 |
| 45090.822916666664 | 385.26 |
| 45090.833333333336 | 37.23 |
| 45090.84375 | 118.61 |
| 45090.854166666664 | 159.64 |
| 45090.864583333336 | 107.71 |
| 45090.875 | 58 |
| 45090.885416666664 | 36.85 |
| 45090.895833333336 | 49.27 |
| 45090.90625 | 330.07 |
| 45090.916666666664 | 23.07 |
| 45090.927083333336 | 20.08 |
| 45090.9375 | 138.08 |
| 45090.947916666664 | 20.48 |
| 45090.958333333336 | 20.23 |
| 45090.96875 | 22 |
| 45090.979166666664 | 139.77 |
| 45090.989583333336 | 23.23 |
| 45091.0 | 22.7 |
| 45091.010416666664 | 24.14 |
| 45091.020833333336 | 24.47 |
| 45091.03125 | 25.36 |
| 45091.041666666664 | 22.83 |
| 45091.052083333336 | 22.61 |
| 45091.0625 | 21.62 |
| 45091.072916666664 | 21.75 |
| 45091.083333333336 | 22.63 |
| 45091.09375 | 21.96 |
| 45091.104166666664 | 21.07 |
| 45091.114583333336 | 20.62 |
| 45091.125 | 20.61 |
| 45091.135416666664 | 19.86 |
| 45091.145833333336 | 18.82 |
| 45091.15625 | 17.13 |
| 45091.166666666664 | 17.34 |
| 45091.177083333336 | 31.16 |
| 45091.1875 | 105.01 |
| 45091.197916666664 | 115.98 |
| 45091.208333333336 | 92.47 |
| 45091.21875 | 180.65 |
| 45091.229166666664 | 174.03 |
| 45091.239583333336 | 66.11 |
| 45091.25 | 134.7 |
| 45091.260416666664 | 72.2 |
| 45091.270833333336 | 95.48 |
| 45091.28125 | 354.76 |
| 45091.291666666664 | 122.74 |
| 45091.302083333336 | 169.54 |
| 45091.3125 | 99.53 |
| 45091.322916666664 | 197.1 |
| 45091.333333333336 | 140.26 |
| 45091.34375 | 417.35 |
| 45091.354166666664 | 160.95 |
| 45091.364583333336 | 74.29 |
| 45091.375 | 205.84 |
| 45091.385416666664 | 337.53 |
| 45091.395833333336 | 182.07 |
| 45091.40625 | 95.2 |
| 45091.416666666664 | 128.97 |
| 45091.427083333336 | 171.32 |
| 45091.4375 | 115.46 |
| 45091.447916666664 | 46.7 |
| 45091.458333333336 | 63.29 |
| 45091.46875 | 15.56 |
| 45091.479166666664 | 20.34 |
| 45091.489583333336 | 14.07 |
| 45091.5 | 14.23 |
| 45091.510416666664 | 14.18 |
| 45091.520833333336 | 13.48 |
| 45091.53125 | 13.69 |
| 45091.541666666664 | 13.71 |
| 45091.552083333336 | 14.16 |
| 45091.5625 | 12.99 |
| 45091.572916666664 | 12.71 |
| 45091.583333333336 | 12.98 |
| 45091.59375 | 14.63 |
| 45091.604166666664 | 34.14 |
| 45091.614583333336 | 15.2 |
| 45091.625 | 13.77 |
| 45091.635416666664 | 13.4 |
| 45091.645833333336 | 14.24 |
| 45091.65625 | 14.48 |
| 45091.666666666664 | 15.36 |
| 45091.677083333336 | 124.65 |
| 45091.6875 | 133.85 |
| 45091.697916666664 | 272.13 |
| 45091.708333333336 | 77.58 |
| 45091.71875 | 130.84 |
| 45091.729166666664 | 163.11 |
| 45091.739583333336 | 313.48 |
| 45091.75 | 136.13 |
| 45091.760416666664 | 383.1 |
| 45091.770833333336 | 22.78 |
| 45091.78125 | 87.94 |
| 45091.791666666664 | 474.57 |
| 45091.802083333336 | 45.96 |
| 45091.8125 | 18.73 |
| 45091.822916666664 | 87.88 |
| 45091.833333333336 | 392.84 |
| 45091.84375 | 477.67 |
| 45091.854166666664 | 168.22 |
| 45091.864583333336 | 142.44 |
| 45091.875 | 430.8 |
| 45091.885416666664 | 170.97 |
| 45091.895833333336 | 487.8 |
| 45091.90625 | 431.52 |
| 45091.916666666664 | 488.85 |
| 45091.927083333336 | 231.26 |
| 45091.9375 | 202.13 |
| 45091.947916666664 | 209.84 |
| 45091.958333333336 | 151.1 |
| 45091.96875 | 255.36 |
| 45091.979166666664 | 463.24 |
| 45091.989583333336 | 18.8 |
| 45092.0 | 20.57 |
| 45092.010416666664 | 20.07 |
| 45092.020833333336 | 20.29 |
| 45092.03125 | 23.78 |
| 45092.041666666664 | 23.98 |
| 45092.052083333336 | 23.59 |
| 45092.0625 | 23.3 |
| 45092.072916666664 | 22.36 |
| 45092.083333333336 | 20.49 |
| 45092.09375 | 18.89 |
| 45092.104166666664 | 17.83 |
| 45092.114583333336 | 17.39 |
| 45092.125 | 20.53 |
| 45092.135416666664 | 20.3 |
| 45092.145833333336 | 19.83 |
| 45092.15625 | 20.1 |
| 45092.166666666664 | 18.78 |
| 45092.177083333336 | 18.61 |
| 45092.1875 | 17.46 |
| 45092.197916666664 | 16.71 |
| 45092.208333333336 | 17.24 |
| 45092.21875 | 17.85 |
| 45092.229166666664 | 17.32 |
| 45092.239583333336 | 483.77 |
| 45092.25 | 188.75 |
| 45092.260416666664 | 246.13 |
| 45092.270833333336 | 123.81 |
| 45092.28125 | 135.62 |
| 45092.291666666664 | 83.15 |
| 45092.302083333336 | 162.42 |
| 45092.3125 | 200.53 |
| 45092.322916666664 | 99.29 |
| 45092.333333333336 | 102.82 |
| 45092.34375 | 203.64 |
| 45092.354166666664 | 73.23 |
| 45092.364583333336 | 120.12 |
| 45092.375 | 110.09 |
| 45092.385416666664 | 159.86 |
| 45092.395833333336 | 225.01 |
| 45092.40625 | 111.32 |
| 45092.416666666664 | 210.65 |
| 45092.427083333336 | 179.78 |
| 45092.4375 | 213.89 |
| 45092.447916666664 | 107.66 |
| 45092.458333333336 | 140.27 |
| 45092.46875 | 207.65 |
| 45092.479166666664 | 266.03 |
| 45092.489583333336 | 488.37 |
| 45092.5 | 14.23 |
| 45092.510416666664 | 13.72 |
| 45092.520833333336 | 14.1 |
| 45092.53125 | 13.7 |
| 45092.541666666664 | 13.65 |
| 45092.552083333336 | 12.91 |
| 45092.5625 | 13.2 |
| 45092.572916666664 | 12.93 |
| 45092.583333333336 | 12.94 |
| 45092.59375 | 13.57 |
| 45092.604166666664 | 13.57 |
| 45092.614583333336 | 13.67 |
| 45092.625 | 13.49 |
| 45092.635416666664 | 13.58 |
| 45092.645833333336 | 13.03 |
| 45092.65625 | 14.26 |
| 45092.666666666664 | 13.88 |
| 45092.677083333336 | 14.83 |
| 45092.6875 | 14.88 |
| 45092.697916666664 | 15 |
| 45092.708333333336 | 15.5 |
| 45092.71875 | 16.54 |
| 45092.729166666664 | 38.71 |
| 45092.739583333336 | 203.95 |
| 45092.75 | 459.2 |
| 45092.760416666664 | 486.98 |
| 45092.770833333336 | 488.68 |
| 45092.78125 | 232.85 |
| 45092.791666666664 | 488.61 |
| 45092.802083333336 | 285.8 |
| 45092.8125 | 109.88 |
| 45092.822916666664 | 481.95 |
| 45092.833333333336 | 414.8 |
| 45092.84375 | 487.84 |
| 45092.854166666664 | 441.62 |
| 45092.864583333336 | 473.5 |
| 45092.875 | 488.26 |
| 45092.885416666664 | 487.76 |
| 45092.895833333336 | 489.29 |
| 45092.90625 | 488.32 |
| 45092.916666666664 | 486.23 |
| 45092.927083333336 | 368.89 |
| 45092.9375 | 164.08 |
| 45092.947916666664 | 367.3 |
| 45092.958333333336 | 337.8 |
| 45092.96875 | 488.09 |
| 45092.979166666664 | 483.94 |
| 45092.989583333336 | 306.53 |
| 45093.0 | 292.85 |
| 45093.010416666664 | 486.95 |
| 45093.020833333336 | 486.36 |
| 45093.03125 | 461.95 |
| 45093.041666666664 | 26.38 |
| 45093.052083333336 | 76.74 |
| 45093.0625 | 28.73 |
| 45093.072916666664 | 25.3 |
| 45093.083333333336 | 23.06 |
| 45093.09375 | 26.69 |
| 45093.104166666664 | 25.16 |
| 45093.114583333336 | 21.24 |
| 45093.125 | 20.37 |
| 45093.135416666664 | 20.2 |
| 45093.145833333336 | 19.04 |
| 45093.15625 | 21.72 |
| 45093.166666666664 | 19.88 |
| 45093.177083333336 | 20.73 |
| 45093.1875 | 20.41 |
| 45093.197916666664 | 19.94 |
| 45093.208333333336 | 19.77 |
| 45093.21875 | 19.11 |
| 45093.229166666664 | 17.45 |
| 45093.239583333336 | 16.86 |
| 45093.25 | 16.85 |
| 45093.260416666664 | 17.4 |
| 45093.270833333336 | 17.67 |
| 45093.28125 | 488.06 |
| 45093.291666666664 | 16.33 |
| 45093.302083333336 | 272.62 |
| 45093.3125 | 434.38 |
| 45093.322916666664 | 273.99 |
| 45093.333333333336 | 333.83 |
| 45093.34375 | 158.01 |
| 45093.354166666664 | 113.22 |
| 45093.364583333336 | 295.69 |
| 45093.375 | 181.78 |
| 45093.385416666664 | 467.7 |
| 45093.395833333336 | 470.78 |
| 45093.40625 | 488.83 |
| 45093.416666666664 | 484.21 |
| 45093.427083333336 | 376.11 |
| 45093.4375 | 488.26 |
| 45093.447916666664 | 487.69 |
| 45093.458333333336 | 467.44 |
| 45093.46875 | 468.51 |
| 45093.479166666664 | 487.97 |
| 45093.489583333336 | 448.17 |
| 45093.5 | 488.4 |
| 45093.510416666664 | 205.15 |
| 45093.520833333336 | 414.47 |
| 45093.53125 | 466.36 |
| 45093.541666666664 | 206.97 |
| 45093.552083333336 | 486.36 |
| 45093.5625 | 15.6 |
| 45093.572916666664 | 15.86 |
| 45093.583333333336 | 16.19 |
| 45093.59375 | 15.32 |
| 45093.604166666664 | 14.98 |
| 45093.614583333336 | 14.85 |
| 45093.625 | 174.31 |
| 45093.635416666664 | 15.21 |
| 45093.645833333336 | 15.64 |
| 45093.65625 | 16.11 |
| 45093.666666666664 | 17.35 |
| 45093.677083333336 | 485.94 |
| 45093.6875 | 19.68 |
| 45093.697916666664 | 263.07 |
| 45093.708333333336 | 16.49 |
| 45093.71875 | 488.07 |
| 45093.729166666664 | 22.62 |
| 45093.739583333336 | 114.38 |
| 45093.75 | 18.26 |
| 45093.760416666664 | 18.78 |
| 45093.770833333336 | 18.89 |
| 45093.78125 | 16.91 |
| 45093.791666666664 | 16.31 |
| 45093.802083333336 | 16.54 |
| 45093.8125 | 17.15 |
| 45093.822916666664 | 19.1 |
| 45093.833333333336 | 20.11 |
| 45093.84375 | 20.76 |
| 45093.854166666664 | 21.71 |
| 45093.864583333336 | 23.13 |
| 45093.875 | 24.07 |
| 45093.885416666664 | 24.01 |
| 45093.895833333336 | 24.61 |
| 45093.90625 | 25.53 |
| 45093.916666666664 | 26.02 |
| 45093.927083333336 | 26.47 |
| 45093.9375 | 25.85 |
| 45093.947916666664 | 25.82 |
| 45093.958333333336 | 25.29 |
| 45093.96875 | 24.95 |
| 45093.979166666664 | 24.03 |
| 45093.989583333336 | 23.22 |
| 45094.0 | 21.56 |
| 45094.010416666664 | 23.96 |
| 45094.020833333336 | 23.44 |
| 45094.03125 | 23.04 |
| 45094.041666666664 | 25.9 |
| 45094.052083333336 | 21.87 |
| 45094.0625 | 22.66 |
| 45094.072916666664 | 21.23 |
| 45094.083333333336 | 18.75 |
| 45094.09375 | 19.68 |
| 45094.104166666664 | 22.48 |
| 45094.114583333336 | 21.76 |
| 45094.125 | 21.37 |
| 45094.135416666664 | 19.92 |
| 45094.145833333336 | 17.53 |
| 45094.15625 | 18.42 |
| 45094.166666666664 | 16.62 |
| 45094.177083333336 | 15.4 |
| 45094.1875 | 15.92 |
| 45094.197916666664 | 14.34 |
| 45094.208333333336 | 13.82 |
| 45094.21875 | 14.75 |
| 45094.229166666664 | 14.95 |
| 45094.239583333336 | 15.04 |
| 45094.25 | 13.73 |
| 45094.260416666664 | 13.97 |
| 45094.270833333336 | 13.31 |
| 45094.28125 | 12.44 |
| 45094.291666666664 | 12.07 |
| 45094.302083333336 | 12.64 |
| 45094.3125 | 13.67 |
| 45094.322916666664 | 12.59 |
| 45094.333333333336 | 13.02 |
| 45094.34375 | 12.27 |
| 45094.354166666664 | 11.04 |
| 45094.364583333336 | 11.67 |
| 45094.375 | 11.76 |
| 45094.385416666664 | 12.6 |
| 45094.395833333336 | 13.27 |
| 45094.40625 | 13 |
| 45094.416666666664 | 13.25 |
| 45094.427083333336 | 13.21 |
| 45094.4375 | 12.95 |
| 45094.447916666664 | 12.47 |
| 45094.458333333336 | 12.32 |
| 45094.46875 | 12.44 |
| 45094.479166666664 | 11.93 |
| 45094.489583333336 | 12.3 |
| 45094.5 | 12.58 |
| 45094.510416666664 | 12.13 |
| 45094.520833333336 | 11.47 |
| 45094.53125 | 12.03 |
| 45094.541666666664 | 11.63 |
| 45094.552083333336 | 11.94 |
| 45094.5625 | 12.31 |
| 45094.572916666664 | 12.51 |
| 45094.583333333336 | 12.24 |
| 45094.59375 | 12.53 |
| 45094.604166666664 | 12.66 |
| 45094.614583333336 | 12.16 |
| 45094.625 | 12.31 |
| 45094.635416666664 | 12.6 |
| 45094.645833333336 | 12 |
| 45094.65625 | 10.92 |
| 45094.666666666664 | 12.27 |
| 45094.677083333336 | 13.35 |
| 45094.6875 | 13.9 |
| 45094.697916666664 | 11.57 |
| 45094.708333333336 | 13.28 |
| 45094.71875 | 13.71 |
| 45094.729166666664 | 14.83 |
| 45094.739583333336 | 14.91 |
| 45094.75 | 15.74 |
| 45094.760416666664 | 14.48 |
| 45094.770833333336 | 16.07 |
| 45094.78125 | 15.55 |
| 45094.791666666664 | 18.54 |
| 45094.802083333336 | 16.34 |
| 45094.8125 | 15.64 |
| 45094.822916666664 | 15.72 |
| 45094.833333333336 | 15.52 |
| 45094.84375 | 15.86 |
| 45094.854166666664 | 17.13 |
| 45094.864583333336 | 17.48 |
| 45094.875 | 17.67 |
| 45094.885416666664 | 17.74 |
| 45094.895833333336 | 18.3 |
| 45094.90625 | 18.63 |
| 45094.916666666664 | 20.46 |
| 45094.927083333336 | 21.05 |
| 45094.9375 | 21.75 |
| 45094.947916666664 | 21.89 |
| 45094.958333333336 | 22.67 |
| 45094.96875 | 23.6 |
| 45094.979166666664 | 24.58 |
| 45094.989583333336 | 23.7 |
| 45095.0 | 23.87 |
| 45095.010416666664 | 24.3 |
| 45095.020833333336 | 28.51 |
| 45095.03125 | 27.96 |
| 45095.041666666664 | 24.49 |
| 45095.052083333336 | 24.43 |
| 45095.0625 | 24.9 |
| 45095.072916666664 | 24.19 |
| 45095.083333333336 | 21.78 |
| 45095.09375 | 22.13 |
| 45095.104166666664 | 22.02 |
| 45095.114583333336 | 20.38 |
| 45095.125 | 21.2 |
| 45095.135416666664 | 19.12 |
| 45095.145833333336 | 18.31 |
| 45095.15625 | 20.23 |
| 45095.166666666664 | 17 |
| 45095.177083333336 | 16.35 |
| 45095.1875 | 15.29 |
| 45095.197916666664 | 14.14 |
| 45095.208333333336 | 15.51 |
| 45095.21875 | 13.71 |
| 45095.229166666664 | 15.06 |
| 45095.239583333336 | 13.83 |
| 45095.25 | 15.05 |
| 45095.260416666664 | 15.48 |
| 45095.270833333336 | 15.82 |
| 45095.28125 | 14.7 |
| 45095.291666666664 | 15.29 |
| 45095.302083333336 | 14.25 |
| 45095.3125 | 13.99 |
| 45095.322916666664 | 16.36 |
| 45095.333333333336 | 15.4 |
| 45095.34375 | 14.84 |
| 45095.354166666664 | 14.04 |
| 45095.364583333336 | 13.39 |
| 45095.375 | 12.87 |
| 45095.385416666664 | 13.19 |
| 45095.395833333336 | 14.62 |
| 45095.40625 | 12.65 |
| 45095.416666666664 | 12.59 |
| 45095.427083333336 | 12.27 |
| 45095.4375 | 12.35 |
| 45095.447916666664 | 12.17 |
| 45095.458333333336 | 12.17 |
| 45095.46875 | 12.56 |
| 45095.479166666664 | 12.45 |
| 45095.489583333336 | 13.02 |
| 45095.5 | 12.85 |
| 45095.510416666664 | 12.78 |
| 45095.520833333336 | 12.91 |
| 45095.53125 | 13.36 |
| 45095.541666666664 | 12.6 |
| 45095.552083333336 | 12.18 |
| 45095.5625 | 12.95 |
| 45095.572916666664 | 11.92 |
| 45095.583333333336 | 12.34 |
| 45095.59375 | 12.31 |
| 45095.604166666664 | 11.48 |
| 45095.614583333336 | 12.02 |
| 45095.625 | 13.44 |
| 45095.635416666664 | 11.92 |
| 45095.645833333336 | 11.44 |
| 45095.65625 | 11.26 |
| 45095.666666666664 | 11.42 |
| 45095.677083333336 | 10.37 |
| 45095.6875 | 11 |
| 45095.697916666664 | 12.66 |
| 45095.708333333336 | 12.32 |
| 45095.71875 | 13.52 |
| 45095.729166666664 | 14.08 |
| 45095.739583333336 | 14.82 |
| 45095.75 | 16.02 |
| 45095.760416666664 | 16.3 |
| 45095.770833333336 | 16.56 |
| 45095.78125 | 17.88 |
| 45095.791666666664 | 18.47 |
| 45095.802083333336 | 20.58 |
| 45095.8125 | 21.7 |
| 45095.822916666664 | 24.49 |
| 45095.833333333336 | 20.98 |
| 45095.84375 | 20.96 |
| 45095.854166666664 | 21.52 |
| 45095.864583333336 | 20.11 |
| 45095.875 | 21.35 |
| 45095.885416666664 | 22.51 |
| 45095.895833333336 | 23.03 |
| 45095.90625 | 23.86 |
| 45095.916666666664 | 25.42 |
| 45095.927083333336 | 25.17 |
| 45095.9375 | 25.62 |
| 45095.947916666664 | 26.12 |
| 45095.958333333336 | 25.8 |
| 45095.96875 | 25.96 |
| 45095.979166666664 | 25.5 |
| 45095.989583333336 | 25.39 |
| 45096.0 | 25.02 |
| 45096.010416666664 | 26.64 |
| 45096.020833333336 | 28.87 |
| 45096.03125 | 30.06 |
| 45096.041666666664 | 31.57 |
| 45096.052083333336 | 31.65 |
| 45096.0625 | 29.48 |
| 45096.072916666664 | 29.23 |
| 45096.083333333336 | 29.35 |
| 45096.09375 | 27.77 |
| 45096.104166666664 | 24.93 |
| 45096.114583333336 | 22.12 |
| 45096.125 | 23.92 |
| 45096.135416666664 | 23.31 |
| 45096.145833333336 | 22.45 |
| 45096.15625 | 24.42 |
| 45096.166666666664 | 22.39 |
| 45096.177083333336 | 22.76 |
| 45096.1875 | 19.41 |
| 45096.197916666664 | 21.2 |
| 45096.208333333336 | 17.84 |
| 45096.21875 | 19.28 |
| 45096.229166666664 | 17.96 |
| 45096.239583333336 | 19.68 |
| 45096.25 | 17.15 |
| 45096.260416666664 | 17.05 |
| 45096.270833333336 | 16.83 |
| 45096.28125 | 18.58 |
| 45096.291666666664 | 16.73 |
| 45096.302083333336 | 17.03 |
| 45096.3125 | 17.04 |
| 45096.322916666664 | 15.95 |
| 45096.333333333336 | 15.5 |
| 45096.34375 | 16.98 |
| 45096.354166666664 | 17.09 |
| 45096.364583333336 | 17.18 |
| 45096.375 | 14.37 |
| 45096.385416666664 | 14.66 |
| 45096.395833333336 | 15.23 |
| 45096.40625 | 14.43 |
| 45096.416666666664 | 14.93 |
| 45096.427083333336 | 14.47 |
| 45096.4375 | 14.8 |
| 45096.447916666664 | 15 |
| 45096.458333333336 | 15.13 |
| 45096.46875 | 15.08 |
| 45096.479166666664 | 15.2 |
| 45096.489583333336 | 15.33 |
| 45096.5 | 14.48 |
| 45096.510416666664 | 15.23 |
| 45096.520833333336 | 15.33 |
| 45096.53125 | 15.41 |
| 45096.541666666664 | 15.57 |
| 45096.552083333336 | 16.36 |
| 45096.5625 | 16.04 |
| 45096.572916666664 | 16.68 |
| 45096.583333333336 | 16.26 |
| 45096.59375 | 16.86 |
| 45096.604166666664 | 16.92 |
| 45096.614583333336 | 16.85 |
| 45096.625 | 15.47 |
| 45096.635416666664 | 15.08 |
| 45096.645833333336 | 13.95 |
| 45096.65625 | 15.66 |
| 45096.666666666664 | 16.06 |
| 45096.677083333336 | 14.38 |
| 45096.6875 | 14.67 |
| 45096.697916666664 | 14.27 |
| 45096.708333333336 | 14.48 |
| 45096.71875 | 14.81 |
| 45096.729166666664 | 14.5 |
| 45096.739583333336 | 15.59 |
| 45096.75 | 17.41 |
| 45096.760416666664 | 18.46 |
| 45096.770833333336 | 20.11 |
| 45096.78125 | 20.06 |
| 45096.791666666664 | 22.18 |
| 45096.802083333336 | 23.59 |
| 45096.8125 | 24.41 |
| 45096.822916666664 | 26.89 |
| 45096.833333333336 | 27.57 |
| 45096.84375 | 29.76 |
| 45096.854166666664 | 26.1 |
| 45096.864583333336 | 26.01 |
| 45096.875 | 26.63 |
| 45096.885416666664 | 25.26 |
| 45096.895833333336 | 26.25 |
| 45096.90625 | 34.53 |
| 45096.916666666664 | 36.57 |
| 45096.927083333336 | 35.99 |
| 45096.9375 | 39.04 |
| 45096.947916666664 | 40.13 |
| 45096.958333333336 | 43.34 |
| 45096.96875 | 46.1 |
| 45096.979166666664 | 49.27 |
| 45096.989583333336 | 50.04 |
| 45097.0 | 48.63 |
| 45097.010416666664 | 50.58 |
| 45097.020833333336 | 51.88 |
| 45097.03125 | 52.24 |
| 45097.041666666664 | 52.91 |
| 45097.052083333336 | 49.18 |
| 45097.0625 | 48.48 |
| 45097.072916666664 | 47.68 |
| 45097.083333333336 | 48.04 |
| 45097.09375 | 45.77 |
| 45097.104166666664 | 48.33 |
| 45097.114583333336 | 46.61 |
| 45097.125 | 44.52 |
| 45097.135416666664 | 40.8 |
| 45097.145833333336 | 42.01 |
| 45097.15625 | 43.73 |
| 45097.166666666664 | 42 |
| 45097.177083333336 | 44.88 |
| 45097.1875 | 39.28 |
| 45097.197916666664 | 43.04 |
| 45097.208333333336 | 40.92 |
| 45097.21875 | 34.62 |
| 45097.229166666664 | 35.74 |
| 45097.239583333336 | 37.17 |
| 45097.25 | 32.66 |
| 45097.260416666664 | 27.61 |
| 45097.270833333336 | 27.81 |
| 45097.28125 | 27.88 |
| 45097.291666666664 | 28.18 |
| 45097.302083333336 | 25.5 |
| 45097.3125 | 25.43 |
| 45097.322916666664 | 24.58 |
| 45097.333333333336 | 23.51 |
| 45097.34375 | 22.2 |
| 45097.354166666664 | 20.43 |
| 45097.364583333336 | 18.59 |
| 45097.375 | 20.24 |
| 45097.385416666664 | 18.84 |
| 45097.395833333336 | 19.34 |
| 45097.40625 | 18.91 |
| 45097.416666666664 | 17.15 |
| 45097.427083333336 | 16.48 |
| 45097.4375 | 16.87 |
| 45097.447916666664 | 17.48 |
| 45097.458333333336 | 18.02 |
| 45097.46875 | 18.16 |
| 45097.479166666664 | 18.39 |
| 45097.489583333336 | 18.96 |
| 45097.5 | 19.6 |
| 45097.510416666664 | 19.47 |
| 45097.520833333336 | 18.91 |
| 45097.53125 | 19.12 |
| 45097.541666666664 | 18.87 |
| 45097.552083333336 | 18.47 |
| 45097.5625 | 18.12 |
| 45097.572916666664 | 17.99 |
| 45097.583333333336 | 18.76 |
| 45097.59375 | 18.93 |
| 45097.604166666664 | 19.68 |
| 45097.614583333336 | 19.73 |
| 45097.625 | 18.97 |
| 45097.635416666664 | 18.95 |
| 45097.645833333336 | 20.34 |
| 45097.65625 | 20.04 |
| 45097.666666666664 | 21.32 |
| 45097.677083333336 | 19.92 |
| 45097.6875 | 19.42 |
| 45097.697916666664 | 18.42 |
| 45097.708333333336 | 18.5 |
| 45097.71875 | 19.31 |
| 45097.729166666664 | 19.57 |
| 45097.739583333336 | 19.53 |
| 45097.75 | 20.09 |
| 45097.760416666664 | 21.05 |
| 45097.770833333336 | 20.7 |
| 45097.78125 | 23.15 |
| 45097.791666666664 | 24.91 |
| 45097.802083333336 | 24.67 |
| 45097.8125 | 25.33 |
| 45097.822916666664 | 24.63 |
| 45097.833333333336 | 25.38 |
| 45097.84375 | 24.99 |
| 45097.854166666664 | 24.51 |
| 45097.864583333336 | 25.31 |
| 45097.875 | 26.32 |
| 45097.885416666664 | 22.32 |
| 45097.895833333336 | 22.53 |
| 45097.90625 | 23.06 |
| 45097.916666666664 | 22.06 |
| 45097.927083333336 | 22 |
| 45097.9375 | 21.88 |
| 45097.947916666664 | 21.4 |
| 45097.958333333336 | 22.2 |
| 45097.96875 | 23.68 |
| 45097.979166666664 | 26.2 |
| 45097.989583333336 | 27.53 |
| 45098.0 | 28.54 |
| 45098.010416666664 | 29.18 |
| 45098.020833333336 | 29.13 |
| 45098.03125 | 30.18 |
| 45098.041666666664 | 30 |
| 45098.052083333336 | 28.53 |
| 45098.0625 | 28.58 |
| 45098.072916666664 | 29.89 |
| 45098.083333333336 | 28.55 |
| 45098.09375 | 29.43 |
| 45098.104166666664 | 28.74 |
| 45098.114583333336 | 28.56 |
| 45098.125 | 25.92 |
| 45098.135416666664 | 24.08 |
| 45098.145833333336 | 23.51 |
| 45098.15625 | 22.03 |
| 45098.166666666664 | 21.46 |
| 45098.177083333336 | 20.61 |
| 45098.1875 | 20.47 |
| 45098.197916666664 | 22.32 |
| 45098.208333333336 | 21.99 |
| 45098.21875 | 21.84 |
| 45098.229166666664 | 19.32 |
| 45098.239583333336 | 19.57 |
| 45098.25 | 19.57 |
| 45098.260416666664 | 21.14 |
| 45098.270833333336 | 22.89 |
| 45098.28125 | 23.56 |
| 45098.291666666664 | 22.56 |
| 45098.302083333336 | 23.23 |
| 45098.3125 | 22.39 |
| 45098.322916666664 | 22.89 |
| 45098.333333333336 | 20.21 |
| 45098.34375 | 22.08 |
| 45098.354166666664 | 21.78 |
| 45098.364583333336 | 25.98 |
| 45098.375 | 26.66 |
| 45098.385416666664 | 27.97 |
| 45098.395833333336 | 30.74 |
| 45098.40625 | 30.53 |
| 45098.416666666664 | 26.73 |
| 45098.427083333336 | 26.74 |
| 45098.4375 | 27.4 |
| 45098.447916666664 | 28.1 |
| 45098.458333333336 | 29.48 |
| 45098.46875 | 32.25 |
| 45098.479166666664 | 29.9 |
| 45098.489583333336 | 29.85 |
| 45098.5 | 25.88 |
| 45098.510416666664 | 27.12 |
| 45098.520833333336 | 27.41 |
| 45098.53125 | 29.33 |
| 45098.541666666664 | 28.68 |
| 45098.552083333336 | 30.83 |
| 45098.5625 | 27.67 |
| 45098.572916666664 | 25.19 |
| 45098.583333333336 | 26.35 |
| 45098.59375 | 27.18 |
| 45098.604166666664 | 27.65 |
| 45098.614583333336 | 29.23 |
| 45098.625 | 30.85 |
| 45098.635416666664 | 31.49 |
| 45098.645833333336 | 29.99 |
| 45098.65625 | 30.71 |
| 45098.666666666664 | 31.3 |
| 45098.677083333336 | 31.7 |
| 45098.6875 | 32.05 |
| 45098.697916666664 | 31.28 |
| 45098.708333333336 | 31.38 |
| 45098.71875 | 32.22 |
| 45098.729166666664 | 32.29 |
| 45098.739583333336 | 32.17 |
| 45098.75 | 32.21 |
| 45098.760416666664 | 31.99 |
| 45098.770833333336 | 32.2 |
| 45098.78125 | 32.13 |
| 45098.791666666664 | 31.22 |
| 45098.802083333336 | 32.44 |
| 45098.8125 | 29.99 |
| 45098.822916666664 | 29.41 |
| 45098.833333333336 | 29.36 |
| 45098.84375 | 28.98 |
| 45098.864583333336 | 29.82 |
| 45098.875 | 30.33 |
| 45098.885416666664 | 28.9 |
| 45098.895833333336 | 31.96 |
| 45098.90625 | 29.83 |
| 45098.916666666664 | 32.43 |
| 45098.927083333336 | 30.73 |
| 45098.9375 | 28.87 |
| 45098.947916666664 | 28.83 |
| 45098.958333333336 | 24.77 |
| 45098.96875 | 23.73 |
| 45098.979166666664 | 26.09 |
| 45098.989583333336 | 27.2 |
| 45099.0 | 27.24 |
| 45099.010416666664 | 27.3 |
| 45099.020833333336 | 26.94 |
| 45099.03125 | 26.07 |
| 45099.041666666664 | 25.31 |
| 45099.052083333336 | 24.63 |
| 45099.0625 | 24 |
| 45099.072916666664 | 23.7 |
| 45099.083333333336 | 21.99 |
| 45099.09375 | 21.28 |
| 45099.104166666664 | 20.35 |
| 45099.114583333336 | 19.58 |
| 45099.125 | 19.56 |
| 45099.135416666664 | 19.35 |
| 45099.145833333336 | 17.31 |
| 45099.15625 | 17.11 |
| 45099.166666666664 | 17.97 |
| 45099.177083333336 | 17.01 |
| 45099.1875 | 18.1 |
| 45099.197916666664 | 17.94 |
| 45099.208333333336 | 17.7 |
| 45099.21875 | 17.23 |
| 45099.229166666664 | 17.37 |
| 45099.239583333336 | 17.48 |
| 45099.25 | 17.58 |
| 45099.260416666664 | 18.21 |
| 45099.270833333336 | 18.07 |
| 45099.28125 | 17.87 |
| 45099.291666666664 | 18.8 |
| 45099.302083333336 | 18.02 |
| 45099.3125 | 17.29 |
| 45099.322916666664 | 18.05 |
| 45099.333333333336 | 16.87 |
| 45099.34375 | 17.57 |
| 45099.354166666664 | 17.19 |
| 45099.364583333336 | 17.79 |
| 45099.375 | 16.34 |
| 45099.385416666664 | 16.26 |
| 45099.395833333336 | 18.31 |
| 45099.40625 | 18.18 |
| 45099.416666666664 | 15.88 |
| 45099.427083333336 | 16.38 |
| 45099.4375 | 15.94 |
| 45099.447916666664 | 15.11 |
| 45099.458333333336 | 15.39 |
| 45099.46875 | 15.37 |
| 45099.479166666664 | 14.64 |
| 45099.489583333336 | 15.12 |
| 45099.5 | 14.31 |
| 45099.510416666664 | 14.85 |
| 45099.520833333336 | 14.86 |
| 45099.53125 | 14.81 |
| 45099.541666666664 | 14.64 |
| 45099.552083333336 | 14.65 |
| 45099.5625 | 15.03 |
| 45099.572916666664 | 14.43 |
| 45099.583333333336 | 14.19 |
| 45099.59375 | 13.7 |
| 45099.604166666664 | 14.22 |
| 45099.614583333336 | 13.86 |
| 45099.625 | 13.53 |
| 45099.635416666664 | 13.66 |
| 45099.645833333336 | 13.28 |
| 45099.65625 | 13.04 |
| 45099.666666666664 | 12.66 |
| 45099.677083333336 | 13.15 |
| 45099.6875 | 13.23 |
| 45099.697916666664 | 12.77 |
| 45099.708333333336 | 12.99 |
| 45099.71875 | 13.26 |
| 45099.729166666664 | 14.17 |
| 45099.739583333336 | 13.77 |
| 45099.75 | 14.51 |
| 45099.760416666664 | 14.43 |
| 45099.770833333336 | 14.75 |
| 45099.78125 | 13.99 |
| 45099.791666666664 | 14.46 |
| 45099.802083333336 | 15.15 |
| 45099.8125 | 14.43 |
| 45099.822916666664 | 14.06 |
| 45099.833333333336 | 14.52 |
| 45099.84375 | 16.01 |
| 45099.854166666664 | 15.63 |
| 45099.864583333336 | 16.26 |
| 45099.875 | 17.55 |
| 45099.885416666664 | 17.82 |
| 45099.895833333336 | 17.75 |
| 45099.90625 | 17.89 |
| 45099.916666666664 | 18.11 |
| 45099.927083333336 | 17.45 |
| 45099.9375 | 17 |
| 45099.947916666664 | 16.84 |
| 45099.958333333336 | 16.85 |
| 45099.96875 | 16.7 |
| 45099.979166666664 | 15.61 |
| 45099.989583333336 | 15.42 |
| 45100.0 | 15.89 |
| 45100.010416666664 | 15.85 |
| 45100.020833333336 | 17.88 |
| 45100.03125 | 18.46 |
| 45100.041666666664 | 18.05 |
| 45100.052083333336 | 17.79 |
| 45100.0625 | 16.69 |
| 45100.072916666664 | 16.41 |
| 45100.083333333336 | 15.74 |
| 45100.09375 | 15.35 |
| 45100.104166666664 | 14.95 |
| 45100.114583333336 | 14.95 |
| 45100.125 | 14.61 |
| 45100.135416666664 | 14.89 |
| 45100.145833333336 | 15 |
| 45100.15625 | 15.33 |
| 45100.166666666664 | 14.98 |
| 45100.177083333336 | 14.63 |
| 45100.1875 | 15.14 |
| 45100.197916666664 | 16.04 |
| 45100.208333333336 | 14.5 |
| 45100.21875 | 15.66 |
| 45100.229166666664 | 13.31 |
| 45100.239583333336 | 12.94 |
| 45100.25 | 13.61 |
| 45100.260416666664 | 13.33 |
| 45100.270833333336 | 12.61 |
| 45100.28125 | 11.8 |
| 45100.291666666664 | 13.55 |
| 45100.302083333336 | 10.97 |
| 45100.3125 | 11.42 |
| 45100.322916666664 | 11.09 |
| 45100.333333333336 | 11.55 |
| 45100.34375 | 10.94 |
| 45100.354166666664 | 10.77 |
| 45100.364583333336 | 11.35 |
| 45100.375 | 12.19 |
| 45100.385416666664 | 11.81 |
| 45100.395833333336 | 12.22 |
| 45100.40625 | 11.85 |
| 45100.416666666664 | 11.67 |
| 45100.427083333336 | 11.76 |
| 45100.4375 | 12.15 |
| 45100.447916666664 | 12.74 |
| 45100.458333333336 | 12.76 |
| 45100.46875 | 12.43 |
| 45100.479166666664 | 12.48 |
| 45100.489583333336 | 11.83 |
| 45100.5 | 12.28 |
| 45100.510416666664 | 11.79 |
| 45100.520833333336 | 12.18 |
| 45100.53125 | 12.69 |
| 45100.541666666664 | 12.04 |
| 45100.552083333336 | 14.1 |
| 45100.5625 | 13.66 |
| 45100.572916666664 | 14.02 |
| 45100.583333333336 | 13.77 |
| 45100.59375 | 14.03 |
| 45100.604166666664 | 14.05 |
| 45100.614583333336 | 14.73 |
| 45100.625 | 14.22 |
| 45100.635416666664 | 14.56 |
| 45100.645833333336 | 14.47 |
| 45100.65625 | 14.62 |
| 45100.666666666664 | 14.4 |
| 45100.677083333336 | 14.53 |
| 45100.6875 | 14.82 |
| 45100.697916666664 | 14.52 |
| 45100.708333333336 | 14.89 |
| 45100.71875 | 15.07 |
| 45100.729166666664 | 14.01 |
| 45100.739583333336 | 15.21 |
| 45100.75 | 15.04 |
| 45100.760416666664 | 15.88 |
| 45100.770833333336 | 13.64 |
| 45100.78125 | 15.62 |
| 45100.791666666664 | 14.41 |
| 45100.802083333336 | 13.38 |
| 45100.8125 | 13.52 |
| 45100.822916666664 | 13.1 |
| 45100.833333333336 | 13 |
| 45100.84375 | 12.88 |
| 45100.854166666664 | 14.32 |
| 45100.864583333336 | 15.16 |
| 45100.875 | 16.14 |
| 45100.885416666664 | 14.85 |
| 45100.895833333336 | 16.78 |
| 45100.90625 | 17.32 |
| 45100.916666666664 | 18 |
| 45100.927083333336 | 17.59 |
| 45100.9375 | 17.66 |
| 45100.947916666664 | 17.78 |
| 45100.958333333336 | 17.7 |
| 45100.96875 | 17.39 |
| 45100.979166666664 | 16.54 |
| 45100.989583333336 | 17.05 |
| 45101.0 | 17.48 |
| 45101.010416666664 | 18.53 |
| 45101.020833333336 | 16.85 |
| 45101.03125 | 17.85 |
| 45101.041666666664 | 18.54 |
| 45101.052083333336 | 19.41 |
| 45101.0625 | 19.31 |
| 45101.072916666664 | 19.79 |
| 45101.083333333336 | 19.84 |
| 45101.09375 | 19.45 |
| 45101.104166666664 | 20.34 |
| 45101.114583333336 | 21.42 |
| 45101.125 | 20.56 |
| 45101.135416666664 | 20.71 |
| 45101.145833333336 | 20.55 |
| 45101.15625 | 19 |
| 45101.166666666664 | 17.64 |
| 45101.177083333336 | 17.39 |
| 45101.1875 | 16.99 |
| 45101.197916666664 | 17.54 |
| 45101.208333333336 | 17.18 |
| 45101.21875 | 18.45 |
| 45101.229166666664 | 17.67 |
| 45101.239583333336 | 17.52 |
| 45101.25 | 16.62 |
| 45101.260416666664 | 16.48 |
| 45101.270833333336 | 14.96 |
| 45101.28125 | 14.61 |
| 45101.291666666664 | 14.4 |
| 45101.302083333336 | 12.08 |
| 45101.3125 | 14.67 |
| 45101.322916666664 | 15.18 |
| 45101.333333333336 | 13.93 |
| 45101.34375 | 14.61 |
| 45101.354166666664 | 13.85 |
| 45101.364583333336 | 12.34 |
| 45101.375 | 12.13 |
| 45101.385416666664 | 12.71 |
| 45101.395833333336 | 12.79 |
| 45101.40625 | 12.72 |
| 45101.416666666664 | 12 |
| 45101.427083333336 | 12.32 |
| 45101.4375 | 12.45 |
| 45101.447916666664 | 12.79 |
| 45101.458333333336 | 13.94 |
| 45101.46875 | 13.48 |
| 45101.479166666664 | 14.55 |
| 45101.489583333336 | 14.01 |
| 45101.5 | 13.63 |
| 45101.510416666664 | 11.88 |
| 45101.520833333336 | 11.72 |
| 45101.53125 | 11.22 |
| 45101.541666666664 | 11.71 |
| 45101.552083333336 | 11.64 |
| 45101.5625 | 11.3 |
| 45101.572916666664 | 11.99 |
| 45101.583333333336 | 12.14 |
| 45101.59375 | 12.79 |
| 45101.604166666664 | 13.26 |
| 45101.614583333336 | 12.04 |
| 45101.625 | 13.39 |
| 45101.635416666664 | 12.37 |
| 45101.645833333336 | 13.09 |
| 45101.65625 | 12.68 |
| 45101.666666666664 | 13.13 |
| 45101.677083333336 | 12.53 |
| 45101.6875 | 12.45 |
| 45101.697916666664 | 12.99 |
| 45101.708333333336 | 12.91 |
| 45101.71875 | 12.82 |
| 45101.729166666664 | 14.03 |
| 45101.739583333336 | 13.53 |
| 45101.75 | 12.61 |
| 45101.760416666664 | 14.02 |
| 45101.770833333336 | 14.76 |
| 45101.78125 | 14.39 |
| 45101.791666666664 | 16.42 |
| 45101.802083333336 | 14.32 |
| 45101.8125 | 15.52 |
| 45101.822916666664 | 14.04 |
| 45101.833333333336 | 13.43 |
| 45101.84375 | 13.36 |
| 45101.854166666664 | 15.08 |
| 45101.864583333336 | 14.02 |
| 45101.875 | 15.04 |
| 45101.885416666664 | 13.15 |
| 45101.895833333336 | 16.55 |
| 45101.90625 | 15.32 |
| 45101.916666666664 | 15.87 |
| 45101.927083333336 | 17.1 |
| 45101.9375 | 17.21 |
| 45101.947916666664 | 17.04 |
| 45101.958333333336 | 17.34 |
| 45101.96875 | 18.02 |
| 45101.979166666664 | 17.59 |
| 45101.989583333336 | 17.3 |
| 45102.0 | 16.38 |
| 45102.010416666664 | 16.8 |
| 45102.020833333336 | 17.28 |
| 45102.03125 | 17.88 |
| 45102.041666666664 | 17.19 |
| 45102.052083333336 | 16.2 |
| 45102.0625 | 15.56 |
| 45102.072916666664 | 16.36 |
| 45102.083333333336 | 20.32 |
| 45102.09375 | 21.01 |
| 45102.104166666664 | 21.19 |
| 45102.114583333336 | 20.77 |
| 45102.125 | 20.83 |
| 45102.135416666664 | 20.17 |
| 45102.145833333336 | 20.38 |
| 45102.15625 | 18.42 |
| 45102.166666666664 | 18.19 |
| 45102.177083333336 | 17.36 |
| 45102.1875 | 17.14 |
| 45102.197916666664 | 16.71 |
| 45102.208333333336 | 16.4 |
| 45102.21875 | 17.43 |
| 45102.229166666664 | 17.18 |
| 45102.239583333336 | 16.56 |
| 45102.25 | 16.37 |
| 45102.260416666664 | 16.56 |
| 45102.270833333336 | 18.65 |
| 45102.28125 | 17.55 |
| 45102.291666666664 | 16.92 |
| 45102.302083333336 | 14.59 |
| 45102.3125 | 15.35 |
| 45102.322916666664 | 15.93 |
| 45102.333333333336 | 14.38 |
| 45102.34375 | 14.88 |
| 45102.354166666664 | 15.5 |
| 45102.364583333336 | 15.22 |
| 45102.375 | 14.43 |
| 45102.385416666664 | 12.44 |
| 45102.395833333336 | 12.1 |
| 45102.40625 | 12.06 |
| 45102.416666666664 | 11.74 |
| 45102.427083333336 | 12.09 |
| 45102.4375 | 11.95 |
| 45102.447916666664 | 11.99 |
| 45102.458333333336 | 11.76 |
| 45102.46875 | 12.45 |
| 45102.479166666664 | 12.23 |
| 45102.489583333336 | 12.57 |
| 45102.5 | 13.22 |
| 45102.510416666664 | 13.73 |
| 45102.520833333336 | 14.02 |
| 45102.53125 | 14.08 |
| 45102.541666666664 | 14.27 |
| 45102.552083333336 | 13.73 |
| 45102.5625 | 11.04 |
| 45102.572916666664 | 10.43 |
| 45102.583333333336 | 10.69 |
| 45102.59375 | 11 |
| 45102.604166666664 | 11.59 |
| 45102.614583333336 | 12.31 |
| 45102.625 | 12.65 |
| 45102.635416666664 | 11.97 |
| 45102.645833333336 | 13.33 |
| 45102.65625 | 12.95 |
| 45102.666666666664 | 12.73 |
| 45102.677083333336 | 12.64 |
| 45102.6875 | 12.71 |
| 45102.697916666664 | 12.72 |
| 45102.708333333336 | 12.58 |
| 45102.71875 | 12.29 |
| 45102.729166666664 | 12.75 |
| 45102.739583333336 | 13.29 |
| 45102.75 | 13.95 |
| 45102.760416666664 | 18.31 |
| 45102.770833333336 | 18.25 |
| 45102.78125 | 17.34 |
| 45102.791666666664 | 17.03 |
| 45102.802083333336 | 21.34 |
| 45102.8125 | 23.57 |
| 45102.822916666664 | 21.45 |
| 45102.833333333336 | 25.43 |
| 45102.84375 | 23.46 |
| 45102.854166666664 | 18.5 |
| 45102.864583333336 | 17.28 |
| 45102.875 | 15.89 |
| 45102.885416666664 | 15.57 |
| 45102.895833333336 | 16.23 |
| 45102.90625 | 18.37 |
| 45102.916666666664 | 17.35 |
| 45102.927083333336 | 16.83 |
| 45102.9375 | 16.89 |
| 45102.947916666664 | 16.91 |
| 45102.958333333336 | 17.05 |
| 45102.96875 | 17.86 |
| 45102.979166666664 | 17.94 |
| 45102.989583333336 | 18.19 |
| 45103.0 | 18.5 |
| 45103.010416666664 | 18.08 |
| 45103.020833333336 | 20.1 |
| 45103.03125 | 21.11 |
| 45103.041666666664 | 20.02 |
| 45103.052083333336 | 18.51 |
| 45103.0625 | 17.3 |
| 45103.072916666664 | 16.37 |
| 45103.083333333336 | 16.49 |
| 45103.09375 | 17.1 |
| 45103.104166666664 | 20.84 |
| 45103.114583333336 | 23.31 |
| 45103.125 | 21.85 |
| 45103.135416666664 | 21.97 |
| 45103.145833333336 | 22.54 |
| 45103.15625 | 22.03 |
| 45103.166666666664 | 24.44 |
| 45103.177083333336 | 25.1 |
| 45103.1875 | 24.23 |
| 45103.197916666664 | 24.04 |
| 45103.208333333336 | 23.75 |
| 45103.21875 | 22.79 |
| 45103.229166666664 | 22.8 |
| 45103.239583333336 | 23.5 |
| 45103.25 | 23.21 |
| 45103.260416666664 | 22.32 |
| 45103.270833333336 | 21.2 |
| 45103.28125 | 21.87 |
| 45103.291666666664 | 20.5 |
| 45103.302083333336 | 21.43 |
| 45103.3125 | 19.03 |
| 45103.322916666664 | 82.25 |
| 45103.333333333336 | 17.77 |
| 45103.34375 | 17.81 |
| 45103.354166666664 | 16.44 |
| 45103.364583333336 | 17.12 |
| 45103.375 | 15.58 |
| 45103.385416666664 | 16.55 |
| 45103.395833333336 | 15.31 |
| 45103.40625 | 17.21 |
| 45103.416666666664 | 14.7 |
| 45103.427083333336 | 14.21 |
| 45103.4375 | 13.31 |
| 45103.447916666664 | 14.54 |
| 45103.458333333336 | 14.21 |
| 45103.46875 | 14.18 |
| 45103.479166666664 | 14.29 |
| 45103.489583333336 | 14.81 |
| 45103.5 | 14.69 |
| 45103.510416666664 | 15.2 |
| 45103.520833333336 | 15.55 |
| 45103.53125 | 16.44 |
| 45103.541666666664 | 15.57 |
| 45103.552083333336 | 13.41 |
| 45103.5625 | 12.44 |
| 45103.572916666664 | 12.38 |
| 45103.583333333336 | 11.83 |
| 45103.59375 | 12.58 |
| 45103.604166666664 | 12.88 |
| 45103.614583333336 | 13.5 |
| 45103.625 | 14.29 |
| 45103.635416666664 | 13.84 |
| 45103.645833333336 | 15.41 |
| 45103.65625 | 14.96 |
| 45103.666666666664 | 16.02 |
| 45103.677083333336 | 15.71 |
| 45103.6875 | 15.75 |
| 45103.697916666664 | 16.78 |
| 45103.708333333336 | 17.22 |
| 45103.71875 | 15.86 |
| 45103.729166666664 | 16.62 |
| 45103.739583333336 | 17.06 |
| 45103.75 | 18.42 |
| 45103.760416666664 | 16.88 |
| 45103.770833333336 | 18 |
| 45103.78125 | 17.95 |
| 45103.791666666664 | 18.21 |
| 45103.802083333336 | 18.19 |
| 45103.8125 | 18.62 |
| 45103.822916666664 | 17.19 |
| 45103.833333333336 | 18.98 |
| 45103.84375 | 20.54 |
| 45103.854166666664 | 17.74 |
| 45103.864583333336 | 20.2 |
| 45103.875 | 20.18 |
| 45103.885416666664 | 20.89 |
| 45103.895833333336 | 21.07 |
| 45103.90625 | 19 |
| 45103.916666666664 | 16.99 |
| 45103.927083333336 | 16.29 |
| 45103.9375 | 16.65 |
| 45103.947916666664 | 17.22 |
| 45103.958333333336 | 17.8 |
| 45103.96875 | 19.48 |
| 45103.979166666664 | 20.39 |
| 45103.989583333336 | 20.67 |
| 45104.0 | 20.96 |
| 45104.010416666664 | 20.99 |
| 45104.020833333336 | 21.56 |
| 45104.03125 | 23.53 |
| 45104.041666666664 | 23.91 |
| 45104.052083333336 | 25.04 |
| 45104.0625 | 25.28 |
| 45104.072916666664 | 25.5 |
| 45104.083333333336 | 23.67 |
| 45104.09375 | 22.36 |
| 45104.104166666664 | 23.84 |
| 45104.114583333336 | 22.55 |
| 45104.125 | 21.21 |
| 45104.135416666664 | 19.9 |
| 45104.145833333336 | 19.1 |
| 45104.15625 | 19.22 |
| 45104.166666666664 | 20.24 |
| 45104.177083333336 | 19.34 |
| 45104.1875 | 19.39 |
| 45104.197916666664 | 16.77 |
| 45104.208333333336 | 18.42 |
| 45104.21875 | 18.12 |
| 45104.229166666664 | 17.71 |
| 45104.239583333336 | 18.29 |
| 45104.25 | 17.36 |
| 45104.260416666664 | 16.85 |
| 45104.270833333336 | 16.46 |
| 45104.28125 | 16.2 |
| 45104.291666666664 | 17.11 |
| 45104.302083333336 | 16.23 |
| 45104.3125 | 16.29 |
| 45104.322916666664 | 15.12 |
| 45104.333333333336 | 15.78 |
| 45104.34375 | 14.45 |
| 45104.354166666664 | 13.09 |
| 45104.364583333336 | 13.1 |
| 45104.375 | 12.98 |
| 45104.385416666664 | 13.41 |
| 45104.395833333336 | 13.26 |
| 45104.40625 | 13.92 |
| 45104.416666666664 | 14.08 |
| 45104.427083333336 | 14.23 |
| 45104.4375 | 14.38 |
| 45104.447916666664 | 13.6 |
| 45104.458333333336 | 14.18 |
| 45104.46875 | 14.29 |
| 45104.479166666664 | 15.2 |
| 45104.489583333336 | 15.3 |
| 45104.5 | 15.32 |
| 45104.510416666664 | 13.94 |
| 45104.520833333336 | 12.09 |
| 45104.53125 | 11.02 |
| 45104.541666666664 | 10.5 |
| 45104.552083333336 | 11.46 |
| 45104.5625 | 12.65 |
| 45104.572916666664 | 13.3 |
| 45104.583333333336 | 12.74 |
| 45104.59375 | 14.34 |
| 45104.604166666664 | 17.13 |
| 45104.614583333336 | 17.09 |
| 45104.625 | 15.46 |
| 45104.635416666664 | 15.72 |
| 45104.645833333336 | 15.53 |
| 45104.65625 | 14.96 |
| 45104.666666666664 | 13.39 |
| 45104.677083333336 | 12.91 |
| 45104.6875 | 13.72 |
| 45104.697916666664 | 15.08 |
| 45104.708333333336 | 17.01 |
| 45104.71875 | 17.09 |
| 45104.729166666664 | 18.13 |
| 45104.739583333336 | 18.79 |
| 45104.75 | 18.34 |
| 45104.760416666664 | 18.66 |
| 45104.770833333336 | 17.73 |
| 45104.78125 | 18.05 |
| 45104.791666666664 | 17.56 |
| 45104.802083333336 | 19.05 |
| 45104.8125 | 18.36 |
| 45104.822916666664 | 18.68 |
| 45104.833333333336 | 18.33 |
| 45104.84375 | 20.62 |
| 45104.854166666664 | 21.12 |
| 45104.864583333336 | 21.91 |
| 45104.875 | 15.55 |
| 45104.885416666664 | 19.76 |
| 45104.895833333336 | 20.02 |
| 45104.90625 | 21.11 |
| 45104.916666666664 | 21.75 |
| 45104.927083333336 | 20.54 |
| 45104.9375 | 21.76 |
| 45104.947916666664 | 21.62 |
| 45104.958333333336 | 20.03 |
| 45104.96875 | 19.17 |
| 45104.979166666664 | 21.25 |
| 45104.989583333336 | 25.04 |
| 45105.0 | 20.76 |
| 45105.010416666664 | 22.02 |
| 45105.020833333336 | 20.52 |
| 45105.03125 | 22.12 |
| 45105.041666666664 | 21.72 |
| 45105.052083333336 | 20.81 |
| 45105.0625 | 20.06 |
| 45105.072916666664 | 19.44 |
| 45105.083333333336 | 19.01 |
| 45105.09375 | 22.24 |
| 45105.104166666664 | 19.71 |
| 45105.114583333336 | 18.7 |
| 45105.125 | 22 |
| 45105.135416666664 | 24.01 |
| 45105.145833333336 | 20.3 |
| 45105.15625 | 19.12 |
| 45105.166666666664 | 18.43 |
| 45105.177083333336 | 18.1 |
| 45105.1875 | 18.67 |
| 45105.197916666664 | 19.58 |
| 45105.208333333336 | 18.14 |
| 45105.21875 | 18.53 |
| 45105.229166666664 | 17.74 |
| 45105.239583333336 | 16.7 |
| 45105.25 | 17.24 |
| 45105.260416666664 | 16.87 |
| 45105.270833333336 | 17.67 |
| 45105.28125 | 13.78 |
| 45105.291666666664 | 15.18 |
| 45105.302083333336 | 15.86 |
| 45105.3125 | 15.07 |
| 45105.322916666664 | 15.27 |
| 45105.333333333336 | 15.91 |
| 45105.34375 | 16.91 |
| 45105.354166666664 | 16.96 |
| 45105.364583333336 | 16.97 |
| 45105.375 | 17.65 |
| 45105.385416666664 | 15.69 |
| 45105.395833333336 | 12.96 |
| 45105.40625 | 13.3 |
| 45105.416666666664 | 12.34 |
| 45105.427083333336 | 13.34 |
| 45105.4375 | 13.09 |
| 45105.447916666664 | 13.15 |
| 45105.458333333336 | 13.7 |
| 45105.46875 | 12.93 |
| 45105.479166666664 | 12.8 |
| 45105.489583333336 | 12.62 |
| 45105.5 | 13.39 |
| 45105.510416666664 | 13.87 |
| 45105.520833333336 | 14.1 |
| 45105.53125 | 14.49 |
| 45105.541666666664 | 14.73 |
| 45105.552083333336 | 14.99 |
| 45105.5625 | 14.86 |
| 45105.572916666664 | 15.82 |
| 45105.583333333336 | 16.38 |
| 45105.59375 | 16.94 |
| 45105.604166666664 | 18.46 |
| 45105.614583333336 | 17.78 |
| 45105.625 | 19.24 |
| 45105.635416666664 | 16.57 |
| 45105.645833333336 | 18.51 |
| 45105.65625 | 11.99 |
| 45105.666666666664 | 11.21 |
| 45105.677083333336 | 11.69 |
| 45105.6875 | 12.34 |
| 45105.697916666664 | 11.99 |
| 45105.708333333336 | 12.17 |
| 45105.71875 | 13.05 |
| 45105.729166666664 | 13.12 |
| 45105.739583333336 | 13.44 |
| 45105.75 | 13.96 |
| 45105.760416666664 | 14.75 |
| 45105.770833333336 | 14.33 |
| 45105.78125 | 15.65 |
| 45105.791666666664 | 16.21 |
| 45105.802083333336 | 16.4 |
| 45105.8125 | 17.31 |
| 45105.822916666664 | 15.7 |
| 45105.833333333336 | 15.66 |
| 45105.84375 | 16.41 |
| 45105.854166666664 | 15.5 |
| 45105.864583333336 | 14.51 |
| 45105.875 | 14.26 |
| 45105.885416666664 | 15.19 |
| 45105.895833333336 | 14.92 |
| 45105.90625 | 16.94 |
| 45105.916666666664 | 14.88 |
| 45105.927083333336 | 15.97 |
| 45105.9375 | 17.18 |
| 45105.947916666664 | 16.13 |
| 45105.958333333336 | 20.84 |
| 45105.96875 | 20.97 |
| 45105.979166666664 | 22.5 |
| 45105.989583333336 | 22.27 |
| 45106.0 | 21.56 |
| 45106.010416666664 | 22.15 |
| 45106.020833333336 | 21.75 |
| 45106.03125 | 22.1 |
| 45106.041666666664 | 21.91 |
| 45106.052083333336 | 21.54 |
| 45106.0625 | 20.77 |
| 45106.072916666664 | 20.49 |
| 45106.083333333336 | 20.53 |
| 45106.09375 | 20.81 |
| 45106.104166666664 | 20.14 |
| 45106.114583333336 | 20.01 |
| 45106.125 | 19.43 |
| 45106.135416666664 | 19.09 |
| 45106.145833333336 | 20.64 |
| 45106.15625 | 21.67 |
| 45106.166666666664 | 20.46 |
| 45106.177083333336 | 21.39 |
| 45106.1875 | 19.16 |
| 45106.197916666664 | 17.75 |
| 45106.208333333336 | 16.91 |
| 45106.21875 | 17.65 |
| 45106.229166666664 | 17.65 |
| 45106.239583333336 | 16.9 |
| 45106.25 | 15.44 |
| 45106.260416666664 | 16.48 |
| 45106.270833333336 | 15.91 |
| 45106.28125 | 15.3 |
| 45106.291666666664 | 15.27 |
| 45106.302083333336 | 15.39 |
| 45106.3125 | 14.02 |
| 45106.322916666664 | 14.43 |
| 45106.333333333336 | 17.08 |
| 45106.34375 | 12.45 |
| 45106.354166666664 | 13.36 |
| 45106.364583333336 | 13.1 |
| 45106.375 | 11.96 |
| 45106.385416666664 | 12.75 |
| 45106.395833333336 | 10.88 |
| 45106.40625 | 10.51 |
| 45106.416666666664 | 11.76 |
| 45106.427083333336 | 10.73 |
| 45106.4375 | 10.35 |
| 45106.447916666664 | 9.96 |
| 45106.458333333336 | 10.32 |
| 45106.46875 | 10.68 |
| 45106.479166666664 | 12.35 |
| 45106.489583333336 | 12.6 |
| 45106.5 | 12.54 |
| 45106.510416666664 | 12.51 |
| 45106.520833333336 | 12.58 |
| 45106.53125 | 12.79 |
| 45106.541666666664 | 14.12 |
| 45106.552083333336 | 14.22 |
| 45106.5625 | 14.7 |
| 45106.572916666664 | 15.58 |
| 45106.583333333336 | 15.6 |
| 45106.59375 | 15.08 |
| 45106.604166666664 | 17.29 |
| 45106.614583333336 | 18.75 |
| 45106.625 | 20.71 |
| 45106.635416666664 | 20.39 |
| 45106.645833333336 | 20.4 |
| 45106.65625 | 20.58 |
| 45106.666666666664 | 19.22 |
| 45106.677083333336 | 29.25 |
| 45106.6875 | 20.46 |
| 45106.697916666664 | 14.09 |
| 45106.708333333336 | 13.59 |
| 45106.71875 | 12.58 |
| 45106.729166666664 | 13.22 |
| 45106.739583333336 | 12.83 |
| 45106.75 | 12.87 |
| 45106.760416666664 | 13.73 |
| 45106.770833333336 | 15.52 |
| 45106.78125 | 15.5 |
| 45106.791666666664 | 15.39 |
| 45106.802083333336 | 16.2 |
| 45106.8125 | 16.97 |
| 45106.822916666664 | 17.34 |
| 45106.833333333336 | 17.83 |
| 45106.84375 | 19.49 |
| 45106.854166666664 | 19.53 |
| 45106.864583333336 | 19.29 |
| 45106.875 | 18.7 |
| 45106.885416666664 | 19.41 |
| 45106.895833333336 | 18.54 |
| 45106.90625 | 19.45 |
| 45106.916666666664 | 20.07 |
| 45106.927083333336 | 18.55 |
| 45106.9375 | 18.96 |
| 45106.947916666664 | 15.84 |
| 45106.958333333336 | 16.41 |
| 45106.96875 | 17.99 |
| 45106.979166666664 | 16.31 |
| 45106.989583333336 | 21.78 |
| 45107.0 | 21.6 |
| 45107.010416666664 | 21.41 |
| 45107.020833333336 | 19.78 |
| 45107.03125 | 20.86 |
| 45107.041666666664 | 22.51 |
| 45107.052083333336 | 21.62 |
| 45107.0625 | 21.37 |
| 45107.072916666664 | 20.62 |
| 45107.083333333336 | 21.07 |
| 45107.09375 | 19.94 |
| 45107.104166666664 | 20.32 |
| 45107.114583333336 | 21.2 |
| 45107.125 | 20.45 |
| 45107.135416666664 | 20.77 |
| 45107.145833333336 | 20.35 |
| 45107.15625 | 20.29 |
| 45107.166666666664 | 20.96 |
| 45107.177083333336 | 21.3 |
| 45107.1875 | 23.81 |
| 45107.197916666664 | 25.76 |
| 45107.208333333336 | 25.72 |
| 45107.21875 | 21.69 |
| 45107.229166666664 | 19.33 |
| 45107.239583333336 | 19.66 |
| 45107.25 | 17.72 |
| 45107.260416666664 | 18.6 |
| 45107.270833333336 | 17.27 |
| 45107.28125 | 16.9 |
| 45107.291666666664 | 16.32 |
| 45107.302083333336 | 15.61 |
| 45107.3125 | 16.44 |
| 45107.322916666664 | 16.03 |
| 45107.333333333336 | 15.22 |
| 45107.34375 | 14.7 |
| 45107.354166666664 | 15.31 |
| 45107.364583333336 | 12.94 |
| 45107.375 | 14.15 |
| 45107.385416666664 | 13.59 |
| 45107.395833333336 | 13.55 |
| 45107.40625 | 13.04 |
| 45107.416666666664 | 12.58 |
| 45107.427083333336 | 12.81 |
| 45107.4375 | 11.61 |
| 45107.447916666664 | 12.16 |
| 45107.458333333336 | 10.48 |
| 45107.46875 | 10.17 |
| 45107.479166666664 | 9.83 |
| 45107.489583333336 | 10.35 |
| 45107.5 | 10.49 |
| 45107.510416666664 | 11.76 |
| 45107.520833333336 | 12.97 |
| 45107.53125 | 11.28 |
| 45107.541666666664 | 12.56 |
| 45107.552083333336 | 12.61 |
| 45107.5625 | 12.93 |
| 45107.572916666664 | 13.38 |
| 45107.583333333336 | 14.11 |
| 45107.59375 | 14.62 |
| 45107.604166666664 | 16.94 |
| 45107.614583333336 | 18.61 |
| 45107.625 | 19.01 |
| 45107.635416666664 | 20.62 |
| 45107.645833333336 | 22.91 |
| 45107.65625 | 25.28 |
| 45107.666666666664 | 28.11 |
| 45107.677083333336 | 36.44 |
| 45107.6875 | 43.92 |
| 45107.697916666664 | 47.73 |
| 45107.708333333336 | 34.97 |
| 45107.71875 | 27.12 |
| 45107.729166666664 | 22.52 |
| 45107.739583333336 | 20.22 |
| 45107.75 | 16.73 |
| 45107.760416666664 | 16.8 |
| 45107.770833333336 | 16.27 |
| 45107.78125 | 16.59 |
| 45107.791666666664 | 17.88 |
| 45107.802083333336 | 17.25 |
| 45107.8125 | 16.94 |
| 45107.822916666664 | 16.54 |
| 45107.833333333336 | 16.79 |
| 45107.84375 | 16.53 |
| 45107.854166666664 | 16.83 |
| 45107.864583333336 | 17.86 |
| 45107.875 | 17.48 |
| 45107.885416666664 | 18.2 |
| 45107.895833333336 | 18.27 |
| 45107.90625 | 18.18 |
| 45107.916666666664 | 18.18 |
| 45107.927083333336 | 18.62 |
| 45107.9375 | 16.22 |
| 45107.947916666664 | 19.29 |
| 45107.958333333336 | 17.23 |
| 45107.96875 | 17.79 |
| 45107.979166666664 | 17.91 |
| 45107.989583333336 | 16.95 |
| 45108.0 | 17.78 |
| 45108.010416666664 | 16.76 |
| 45108.020833333336 | 15.24 |
| 45108.03125 | 15.99 |
| 45108.041666666664 | 16.71 |
| 45108.052083333336 | 16.97 |
| 45108.0625 | 16.43 |
| 45108.072916666664 | 19.2 |
| 45108.083333333336 | 18.39 |
| 45108.09375 | 16.04 |
| 45108.104166666664 | 17.94 |
| 45108.114583333336 | 15.47 |
| 45108.125 | 16.59 |
| 45108.135416666664 | 18.3 |
| 45108.145833333336 | 17.47 |
| 45108.15625 | 19.64 |
| 45108.166666666664 | 20.65 |
| 45108.177083333336 | 22.01 |
| 45108.1875 | 22.2 |
| 45108.197916666664 | 23.02 |
| 45108.208333333336 | 23.09 |
| 45108.21875 | 24.47 |
| 45108.229166666664 | 28.37 |
| 45108.239583333336 | 33.45 |
| 45108.25 | 28.94 |
| 45108.260416666664 | 21.77 |
| 45108.270833333336 | 19.7 |
| 45108.28125 | 19.1 |
| 45108.291666666664 | 17.37 |
| 45108.302083333336 | 18.75 |
| 45108.3125 | 16.99 |
| 45108.322916666664 | 15.99 |
| 45108.333333333336 | 14.85 |
| 45108.34375 | 14.65 |
| 45108.354166666664 | 14.03 |
| 45108.364583333336 | 14.23 |
| 45108.375 | 13.95 |
| 45108.385416666664 | 13.99 |
| 45108.395833333336 | 13.64 |
| 45108.40625 | 13.48 |
| 45108.416666666664 | 12.96 |
| 45108.427083333336 | 12.99 |
| 45108.4375 | 12.22 |
| 45108.447916666664 | 11.35 |
| 45108.458333333336 | 10.08 |
| 45108.46875 | 9.33 |
| 45108.479166666664 | 10.26 |
| 45108.489583333336 | 9.68 |
| 45108.5 | 8.9 |
| 45108.510416666664 | 9.83 |
| 45108.520833333336 | 10.22 |
| 45108.53125 | 10.98 |
| 45108.541666666664 | 12.61 |
| 45108.552083333336 | 13.39 |
| 45108.5625 | 12.77 |
| 45108.572916666664 | 13.15 |
| 45108.583333333336 | 13.8 |
| 45108.59375 | 12.79 |
| 45108.604166666664 | 14.27 |
| 45108.614583333336 | 14.47 |
| 45108.625 | 15.81 |
| 45108.635416666664 | 19.32 |
| 45108.645833333336 | 20.72 |
| 45108.65625 | 24.46 |
| 45108.666666666664 | 25.68 |
| 45108.677083333336 | 28.18 |
| 45108.6875 | 34.58 |
| 45108.697916666664 | 48.28 |
| 45108.708333333336 | 60.79 |
| 45108.71875 | 64.96 |
| 45108.729166666664 | 71.9 |
| 45108.739583333336 | 86.87 |
| 45108.75 | 85.07 |
| 45108.760416666664 | 53.24 |
| 45108.770833333336 | 43.03 |
| 45108.78125 | 38.44 |
| 45108.791666666664 | 29.96 |
| 45108.802083333336 | 26.75 |
| 45108.8125 | 25.15 |
| 45108.822916666664 | 24.24 |
| 45108.833333333336 | 24.21 |
| 45108.84375 | 22.96 |
| 45108.854166666664 | 22.02 |
| 45108.864583333336 | 22.29 |
| 45108.875 | 21.28 |
| 45108.885416666664 | 21 |
| 45108.895833333336 | 20.34 |
| 45108.90625 | 20.24 |
| 45108.916666666664 | 20.19 |
| 45108.927083333336 | 20.01 |
| 45108.9375 | 19.17 |
| 45108.947916666664 | 18.71 |
| 45108.958333333336 | 19.03 |
| 45108.96875 | 18.99 |
| 45108.979166666664 | 18.34 |
| 45108.989583333336 | 19 |
| 45109.0 | 18.01 |
| 45109.010416666664 | 17.5 |
| 45109.020833333336 | 17.06 |
| 45109.03125 | 15.99 |
| 45109.041666666664 | 16.92 |
| 45109.052083333336 | 16.59 |
| 45109.0625 | 17.34 |
| 45109.072916666664 | 17.44 |
| 45109.083333333336 | 17.55 |
| 45109.09375 | 16.96 |